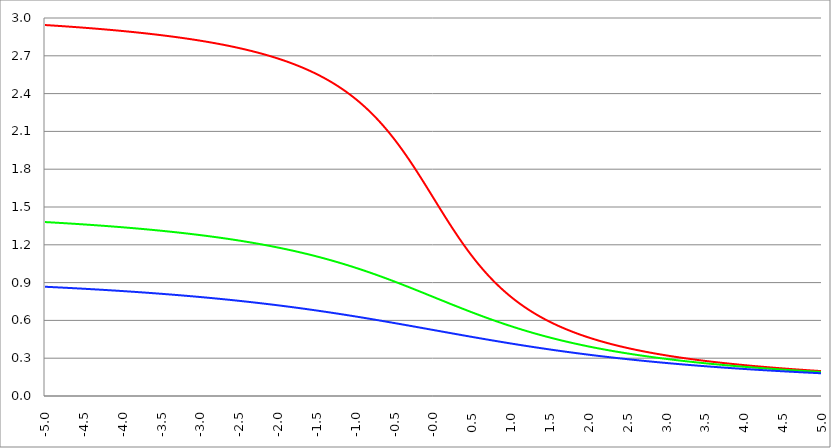
| Category | Series 1 | Series 0 | Series 2 |
|---|---|---|---|
| -5.0 | 2.944 | 1.381 | 0.867 |
| -4.995 | 2.944 | 1.38 | 0.867 |
| -4.99 | 2.944 | 1.38 | 0.867 |
| -4.985 | 2.944 | 1.38 | 0.867 |
| -4.98 | 2.943 | 1.38 | 0.866 |
| -4.975 | 2.943 | 1.38 | 0.866 |
| -4.97 | 2.943 | 1.38 | 0.866 |
| -4.965000000000001 | 2.943 | 1.379 | 0.866 |
| -4.960000000000001 | 2.943 | 1.379 | 0.866 |
| -4.955000000000001 | 2.942 | 1.379 | 0.866 |
| -4.950000000000001 | 2.942 | 1.379 | 0.866 |
| -4.945000000000001 | 2.942 | 1.379 | 0.865 |
| -4.940000000000001 | 2.942 | 1.378 | 0.865 |
| -4.935000000000001 | 2.942 | 1.378 | 0.865 |
| -4.930000000000001 | 2.941 | 1.378 | 0.865 |
| -4.925000000000002 | 2.941 | 1.378 | 0.865 |
| -4.920000000000002 | 2.941 | 1.378 | 0.865 |
| -4.915000000000002 | 2.941 | 1.378 | 0.865 |
| -4.910000000000002 | 2.941 | 1.377 | 0.864 |
| -4.905000000000002 | 2.94 | 1.377 | 0.864 |
| -4.900000000000002 | 2.94 | 1.377 | 0.864 |
| -4.895000000000002 | 2.94 | 1.377 | 0.864 |
| -4.890000000000002 | 2.94 | 1.377 | 0.864 |
| -4.885000000000002 | 2.94 | 1.376 | 0.864 |
| -4.880000000000002 | 2.939 | 1.376 | 0.863 |
| -4.875000000000003 | 2.939 | 1.376 | 0.863 |
| -4.870000000000003 | 2.939 | 1.376 | 0.863 |
| -4.865000000000003 | 2.939 | 1.376 | 0.863 |
| -4.860000000000003 | 2.939 | 1.376 | 0.863 |
| -4.855000000000003 | 2.938 | 1.375 | 0.863 |
| -4.850000000000003 | 2.938 | 1.375 | 0.863 |
| -4.845000000000003 | 2.938 | 1.375 | 0.862 |
| -4.840000000000003 | 2.938 | 1.375 | 0.862 |
| -4.835000000000003 | 2.938 | 1.375 | 0.862 |
| -4.830000000000004 | 2.937 | 1.375 | 0.862 |
| -4.825000000000004 | 2.937 | 1.374 | 0.862 |
| -4.820000000000004 | 2.937 | 1.374 | 0.862 |
| -4.815000000000004 | 2.937 | 1.374 | 0.861 |
| -4.810000000000004 | 2.937 | 1.374 | 0.861 |
| -4.805000000000004 | 2.936 | 1.374 | 0.861 |
| -4.800000000000004 | 2.936 | 1.373 | 0.861 |
| -4.795000000000004 | 2.936 | 1.373 | 0.861 |
| -4.790000000000004 | 2.936 | 1.373 | 0.861 |
| -4.785000000000004 | 2.936 | 1.373 | 0.861 |
| -4.780000000000004 | 2.935 | 1.373 | 0.86 |
| -4.775000000000004 | 2.935 | 1.372 | 0.86 |
| -4.770000000000004 | 2.935 | 1.372 | 0.86 |
| -4.765000000000005 | 2.935 | 1.372 | 0.86 |
| -4.760000000000005 | 2.935 | 1.372 | 0.86 |
| -4.755000000000005 | 2.934 | 1.372 | 0.86 |
| -4.750000000000005 | 2.934 | 1.372 | 0.859 |
| -4.745000000000005 | 2.934 | 1.371 | 0.859 |
| -4.740000000000005 | 2.934 | 1.371 | 0.859 |
| -4.735000000000005 | 2.933 | 1.371 | 0.859 |
| -4.730000000000005 | 2.933 | 1.371 | 0.859 |
| -4.725000000000006 | 2.933 | 1.371 | 0.859 |
| -4.720000000000006 | 2.933 | 1.37 | 0.858 |
| -4.715000000000006 | 2.933 | 1.37 | 0.858 |
| -4.710000000000006 | 2.932 | 1.37 | 0.858 |
| -4.705000000000006 | 2.932 | 1.37 | 0.858 |
| -4.700000000000006 | 2.932 | 1.37 | 0.858 |
| -4.695000000000006 | 2.932 | 1.369 | 0.858 |
| -4.690000000000006 | 2.932 | 1.369 | 0.858 |
| -4.685000000000007 | 2.931 | 1.369 | 0.857 |
| -4.680000000000007 | 2.931 | 1.369 | 0.857 |
| -4.675000000000007 | 2.931 | 1.369 | 0.857 |
| -4.670000000000007 | 2.931 | 1.368 | 0.857 |
| -4.665000000000007 | 2.93 | 1.368 | 0.857 |
| -4.660000000000007 | 2.93 | 1.368 | 0.857 |
| -4.655000000000007 | 2.93 | 1.368 | 0.856 |
| -4.650000000000007 | 2.93 | 1.368 | 0.856 |
| -4.645000000000007 | 2.93 | 1.368 | 0.856 |
| -4.640000000000008 | 2.929 | 1.367 | 0.856 |
| -4.635000000000008 | 2.929 | 1.367 | 0.856 |
| -4.630000000000008 | 2.929 | 1.367 | 0.856 |
| -4.625000000000008 | 2.929 | 1.367 | 0.855 |
| -4.620000000000008 | 2.928 | 1.367 | 0.855 |
| -4.615000000000008 | 2.928 | 1.366 | 0.855 |
| -4.610000000000008 | 2.928 | 1.366 | 0.855 |
| -4.605000000000008 | 2.928 | 1.366 | 0.855 |
| -4.600000000000008 | 2.928 | 1.366 | 0.855 |
| -4.595000000000009 | 2.927 | 1.366 | 0.854 |
| -4.590000000000009 | 2.927 | 1.365 | 0.854 |
| -4.585000000000009 | 2.927 | 1.365 | 0.854 |
| -4.580000000000009 | 2.927 | 1.365 | 0.854 |
| -4.57500000000001 | 2.926 | 1.365 | 0.854 |
| -4.57000000000001 | 2.926 | 1.365 | 0.854 |
| -4.565000000000009 | 2.926 | 1.364 | 0.853 |
| -4.560000000000009 | 2.926 | 1.364 | 0.853 |
| -4.555000000000009 | 2.925 | 1.364 | 0.853 |
| -4.55000000000001 | 2.925 | 1.364 | 0.853 |
| -4.54500000000001 | 2.925 | 1.364 | 0.853 |
| -4.54000000000001 | 2.925 | 1.363 | 0.853 |
| -4.53500000000001 | 2.925 | 1.363 | 0.852 |
| -4.53000000000001 | 2.924 | 1.363 | 0.852 |
| -4.52500000000001 | 2.924 | 1.363 | 0.852 |
| -4.52000000000001 | 2.924 | 1.363 | 0.852 |
| -4.51500000000001 | 2.924 | 1.362 | 0.852 |
| -4.51000000000001 | 2.923 | 1.362 | 0.852 |
| -4.505000000000011 | 2.923 | 1.362 | 0.851 |
| -4.500000000000011 | 2.923 | 1.362 | 0.851 |
| -4.495000000000011 | 2.923 | 1.361 | 0.851 |
| -4.490000000000011 | 2.922 | 1.361 | 0.851 |
| -4.485000000000011 | 2.922 | 1.361 | 0.851 |
| -4.480000000000011 | 2.922 | 1.361 | 0.851 |
| -4.475000000000011 | 2.922 | 1.361 | 0.85 |
| -4.470000000000011 | 2.922 | 1.36 | 0.85 |
| -4.465000000000011 | 2.921 | 1.36 | 0.85 |
| -4.460000000000011 | 2.921 | 1.36 | 0.85 |
| -4.455000000000012 | 2.921 | 1.36 | 0.85 |
| -4.450000000000012 | 2.921 | 1.36 | 0.849 |
| -4.445000000000012 | 2.92 | 1.359 | 0.849 |
| -4.440000000000012 | 2.92 | 1.359 | 0.849 |
| -4.435000000000012 | 2.92 | 1.359 | 0.849 |
| -4.430000000000012 | 2.92 | 1.359 | 0.849 |
| -4.425000000000012 | 2.919 | 1.359 | 0.849 |
| -4.420000000000012 | 2.919 | 1.358 | 0.848 |
| -4.415000000000012 | 2.919 | 1.358 | 0.848 |
| -4.410000000000013 | 2.919 | 1.358 | 0.848 |
| -4.405000000000013 | 2.918 | 1.358 | 0.848 |
| -4.400000000000013 | 2.918 | 1.357 | 0.848 |
| -4.395000000000013 | 2.918 | 1.357 | 0.848 |
| -4.390000000000013 | 2.918 | 1.357 | 0.847 |
| -4.385000000000013 | 2.917 | 1.357 | 0.847 |
| -4.380000000000013 | 2.917 | 1.357 | 0.847 |
| -4.375000000000013 | 2.917 | 1.356 | 0.847 |
| -4.370000000000013 | 2.917 | 1.356 | 0.847 |
| -4.365000000000013 | 2.916 | 1.356 | 0.846 |
| -4.360000000000014 | 2.916 | 1.356 | 0.846 |
| -4.355000000000014 | 2.916 | 1.356 | 0.846 |
| -4.350000000000014 | 2.916 | 1.355 | 0.846 |
| -4.345000000000014 | 2.915 | 1.355 | 0.846 |
| -4.340000000000014 | 2.915 | 1.355 | 0.846 |
| -4.335000000000014 | 2.915 | 1.355 | 0.845 |
| -4.330000000000014 | 2.915 | 1.354 | 0.845 |
| -4.325000000000014 | 2.914 | 1.354 | 0.845 |
| -4.320000000000014 | 2.914 | 1.354 | 0.845 |
| -4.315000000000015 | 2.914 | 1.354 | 0.845 |
| -4.310000000000015 | 2.914 | 1.354 | 0.845 |
| -4.305000000000015 | 2.913 | 1.353 | 0.844 |
| -4.300000000000015 | 2.913 | 1.353 | 0.844 |
| -4.295000000000015 | 2.913 | 1.353 | 0.844 |
| -4.290000000000015 | 2.913 | 1.353 | 0.844 |
| -4.285000000000015 | 2.912 | 1.352 | 0.844 |
| -4.280000000000015 | 2.912 | 1.352 | 0.843 |
| -4.275000000000015 | 2.912 | 1.352 | 0.843 |
| -4.270000000000015 | 2.912 | 1.352 | 0.843 |
| -4.265000000000016 | 2.911 | 1.352 | 0.843 |
| -4.260000000000016 | 2.911 | 1.351 | 0.843 |
| -4.255000000000016 | 2.911 | 1.351 | 0.842 |
| -4.250000000000016 | 2.911 | 1.351 | 0.842 |
| -4.245000000000016 | 2.91 | 1.351 | 0.842 |
| -4.240000000000016 | 2.91 | 1.35 | 0.842 |
| -4.235000000000016 | 2.91 | 1.35 | 0.842 |
| -4.230000000000016 | 2.909 | 1.35 | 0.842 |
| -4.225000000000017 | 2.909 | 1.35 | 0.841 |
| -4.220000000000017 | 2.909 | 1.35 | 0.841 |
| -4.215000000000017 | 2.909 | 1.349 | 0.841 |
| -4.210000000000017 | 2.908 | 1.349 | 0.841 |
| -4.205000000000017 | 2.908 | 1.349 | 0.841 |
| -4.200000000000017 | 2.908 | 1.349 | 0.84 |
| -4.195000000000017 | 2.908 | 1.348 | 0.84 |
| -4.190000000000017 | 2.907 | 1.348 | 0.84 |
| -4.185000000000017 | 2.907 | 1.348 | 0.84 |
| -4.180000000000017 | 2.907 | 1.348 | 0.84 |
| -4.175000000000018 | 2.907 | 1.347 | 0.84 |
| -4.170000000000018 | 2.906 | 1.347 | 0.839 |
| -4.165000000000018 | 2.906 | 1.347 | 0.839 |
| -4.160000000000018 | 2.906 | 1.347 | 0.839 |
| -4.155000000000018 | 2.905 | 1.346 | 0.839 |
| -4.150000000000018 | 2.905 | 1.346 | 0.839 |
| -4.145000000000018 | 2.905 | 1.346 | 0.838 |
| -4.140000000000018 | 2.905 | 1.346 | 0.838 |
| -4.135000000000018 | 2.904 | 1.346 | 0.838 |
| -4.130000000000019 | 2.904 | 1.345 | 0.838 |
| -4.125000000000019 | 2.904 | 1.345 | 0.838 |
| -4.120000000000019 | 2.903 | 1.345 | 0.837 |
| -4.115000000000019 | 2.903 | 1.345 | 0.837 |
| -4.110000000000019 | 2.903 | 1.344 | 0.837 |
| -4.105000000000019 | 2.903 | 1.344 | 0.837 |
| -4.100000000000019 | 2.902 | 1.344 | 0.837 |
| -4.095000000000019 | 2.902 | 1.344 | 0.836 |
| -4.090000000000019 | 2.902 | 1.343 | 0.836 |
| -4.085000000000019 | 2.902 | 1.343 | 0.836 |
| -4.08000000000002 | 2.901 | 1.343 | 0.836 |
| -4.07500000000002 | 2.901 | 1.343 | 0.836 |
| -4.07000000000002 | 2.901 | 1.342 | 0.835 |
| -4.06500000000002 | 2.9 | 1.342 | 0.835 |
| -4.06000000000002 | 2.9 | 1.342 | 0.835 |
| -4.05500000000002 | 2.9 | 1.342 | 0.835 |
| -4.05000000000002 | 2.9 | 1.341 | 0.835 |
| -4.04500000000002 | 2.899 | 1.341 | 0.834 |
| -4.04000000000002 | 2.899 | 1.341 | 0.834 |
| -4.03500000000002 | 2.899 | 1.341 | 0.834 |
| -4.03000000000002 | 2.898 | 1.34 | 0.834 |
| -4.025000000000021 | 2.898 | 1.34 | 0.834 |
| -4.020000000000021 | 2.898 | 1.34 | 0.833 |
| -4.015000000000021 | 2.897 | 1.34 | 0.833 |
| -4.010000000000021 | 2.897 | 1.339 | 0.833 |
| -4.005000000000021 | 2.897 | 1.339 | 0.833 |
| -4.000000000000021 | 2.897 | 1.339 | 0.833 |
| -3.995000000000021 | 2.896 | 1.339 | 0.832 |
| -3.990000000000021 | 2.896 | 1.338 | 0.832 |
| -3.985000000000022 | 2.896 | 1.338 | 0.832 |
| -3.980000000000022 | 2.895 | 1.338 | 0.832 |
| -3.975000000000022 | 2.895 | 1.338 | 0.832 |
| -3.970000000000022 | 2.895 | 1.337 | 0.831 |
| -3.965000000000022 | 2.895 | 1.337 | 0.831 |
| -3.960000000000022 | 2.894 | 1.337 | 0.831 |
| -3.955000000000022 | 2.894 | 1.337 | 0.831 |
| -3.950000000000022 | 2.894 | 1.336 | 0.831 |
| -3.945000000000022 | 2.893 | 1.336 | 0.83 |
| -3.940000000000023 | 2.893 | 1.336 | 0.83 |
| -3.935000000000023 | 2.893 | 1.336 | 0.83 |
| -3.930000000000023 | 2.892 | 1.335 | 0.83 |
| -3.925000000000023 | 2.892 | 1.335 | 0.83 |
| -3.920000000000023 | 2.892 | 1.335 | 0.829 |
| -3.915000000000023 | 2.892 | 1.335 | 0.829 |
| -3.910000000000023 | 2.891 | 1.334 | 0.829 |
| -3.905000000000023 | 2.891 | 1.334 | 0.829 |
| -3.900000000000023 | 2.891 | 1.334 | 0.829 |
| -3.895000000000023 | 2.89 | 1.334 | 0.828 |
| -3.890000000000024 | 2.89 | 1.333 | 0.828 |
| -3.885000000000024 | 2.89 | 1.333 | 0.828 |
| -3.880000000000024 | 2.889 | 1.333 | 0.828 |
| -3.875000000000024 | 2.889 | 1.333 | 0.828 |
| -3.870000000000024 | 2.889 | 1.332 | 0.827 |
| -3.865000000000024 | 2.888 | 1.332 | 0.827 |
| -3.860000000000024 | 2.888 | 1.332 | 0.827 |
| -3.855000000000024 | 2.888 | 1.332 | 0.827 |
| -3.850000000000024 | 2.887 | 1.331 | 0.827 |
| -3.845000000000025 | 2.887 | 1.331 | 0.826 |
| -3.840000000000025 | 2.887 | 1.331 | 0.826 |
| -3.835000000000025 | 2.887 | 1.33 | 0.826 |
| -3.830000000000025 | 2.886 | 1.33 | 0.826 |
| -3.825000000000025 | 2.886 | 1.33 | 0.825 |
| -3.820000000000025 | 2.886 | 1.33 | 0.825 |
| -3.815000000000025 | 2.885 | 1.329 | 0.825 |
| -3.810000000000025 | 2.885 | 1.329 | 0.825 |
| -3.805000000000025 | 2.885 | 1.329 | 0.825 |
| -3.800000000000026 | 2.884 | 1.329 | 0.824 |
| -3.795000000000026 | 2.884 | 1.328 | 0.824 |
| -3.790000000000026 | 2.884 | 1.328 | 0.824 |
| -3.785000000000026 | 2.883 | 1.328 | 0.824 |
| -3.780000000000026 | 2.883 | 1.327 | 0.824 |
| -3.775000000000026 | 2.883 | 1.327 | 0.823 |
| -3.770000000000026 | 2.882 | 1.327 | 0.823 |
| -3.765000000000026 | 2.882 | 1.327 | 0.823 |
| -3.760000000000026 | 2.882 | 1.326 | 0.823 |
| -3.755000000000026 | 2.881 | 1.326 | 0.823 |
| -3.750000000000027 | 2.881 | 1.326 | 0.822 |
| -3.745000000000027 | 2.881 | 1.326 | 0.822 |
| -3.740000000000027 | 2.88 | 1.325 | 0.822 |
| -3.735000000000027 | 2.88 | 1.325 | 0.822 |
| -3.730000000000027 | 2.88 | 1.325 | 0.821 |
| -3.725000000000027 | 2.879 | 1.324 | 0.821 |
| -3.720000000000027 | 2.879 | 1.324 | 0.821 |
| -3.715000000000027 | 2.879 | 1.324 | 0.821 |
| -3.710000000000027 | 2.878 | 1.324 | 0.821 |
| -3.705000000000028 | 2.878 | 1.323 | 0.82 |
| -3.700000000000028 | 2.878 | 1.323 | 0.82 |
| -3.695000000000028 | 2.877 | 1.323 | 0.82 |
| -3.690000000000028 | 2.877 | 1.322 | 0.82 |
| -3.685000000000028 | 2.877 | 1.322 | 0.819 |
| -3.680000000000028 | 2.876 | 1.322 | 0.819 |
| -3.675000000000028 | 2.876 | 1.322 | 0.819 |
| -3.670000000000028 | 2.876 | 1.321 | 0.819 |
| -3.665000000000028 | 2.875 | 1.321 | 0.819 |
| -3.660000000000028 | 2.875 | 1.321 | 0.818 |
| -3.655000000000029 | 2.875 | 1.32 | 0.818 |
| -3.650000000000029 | 2.874 | 1.32 | 0.818 |
| -3.645000000000029 | 2.874 | 1.32 | 0.818 |
| -3.640000000000029 | 2.873 | 1.32 | 0.817 |
| -3.635000000000029 | 2.873 | 1.319 | 0.817 |
| -3.630000000000029 | 2.873 | 1.319 | 0.817 |
| -3.625000000000029 | 2.872 | 1.319 | 0.817 |
| -3.620000000000029 | 2.872 | 1.318 | 0.817 |
| -3.615000000000029 | 2.872 | 1.318 | 0.816 |
| -3.61000000000003 | 2.871 | 1.318 | 0.816 |
| -3.60500000000003 | 2.871 | 1.318 | 0.816 |
| -3.60000000000003 | 2.871 | 1.317 | 0.816 |
| -3.59500000000003 | 2.87 | 1.317 | 0.815 |
| -3.59000000000003 | 2.87 | 1.317 | 0.815 |
| -3.58500000000003 | 2.87 | 1.316 | 0.815 |
| -3.58000000000003 | 2.869 | 1.316 | 0.815 |
| -3.57500000000003 | 2.869 | 1.316 | 0.814 |
| -3.57000000000003 | 2.868 | 1.315 | 0.814 |
| -3.565000000000031 | 2.868 | 1.315 | 0.814 |
| -3.560000000000031 | 2.868 | 1.315 | 0.814 |
| -3.555000000000031 | 2.867 | 1.315 | 0.814 |
| -3.550000000000031 | 2.867 | 1.314 | 0.813 |
| -3.545000000000031 | 2.867 | 1.314 | 0.813 |
| -3.540000000000031 | 2.866 | 1.314 | 0.813 |
| -3.535000000000031 | 2.866 | 1.313 | 0.813 |
| -3.530000000000031 | 2.866 | 1.313 | 0.812 |
| -3.525000000000031 | 2.865 | 1.313 | 0.812 |
| -3.520000000000032 | 2.865 | 1.312 | 0.812 |
| -3.515000000000032 | 2.864 | 1.312 | 0.812 |
| -3.510000000000032 | 2.864 | 1.312 | 0.811 |
| -3.505000000000032 | 2.864 | 1.312 | 0.811 |
| -3.500000000000032 | 2.863 | 1.311 | 0.811 |
| -3.495000000000032 | 2.863 | 1.311 | 0.811 |
| -3.490000000000032 | 2.863 | 1.311 | 0.811 |
| -3.485000000000032 | 2.862 | 1.31 | 0.81 |
| -3.480000000000032 | 2.862 | 1.31 | 0.81 |
| -3.475000000000032 | 2.861 | 1.31 | 0.81 |
| -3.470000000000033 | 2.861 | 1.309 | 0.81 |
| -3.465000000000033 | 2.861 | 1.309 | 0.809 |
| -3.460000000000033 | 2.86 | 1.309 | 0.809 |
| -3.455000000000033 | 2.86 | 1.308 | 0.809 |
| -3.450000000000033 | 2.859 | 1.308 | 0.809 |
| -3.445000000000033 | 2.859 | 1.308 | 0.808 |
| -3.440000000000033 | 2.859 | 1.307 | 0.808 |
| -3.435000000000033 | 2.858 | 1.307 | 0.808 |
| -3.430000000000033 | 2.858 | 1.307 | 0.808 |
| -3.425000000000034 | 2.858 | 1.307 | 0.807 |
| -3.420000000000034 | 2.857 | 1.306 | 0.807 |
| -3.415000000000034 | 2.857 | 1.306 | 0.807 |
| -3.410000000000034 | 2.856 | 1.306 | 0.807 |
| -3.405000000000034 | 2.856 | 1.305 | 0.806 |
| -3.400000000000034 | 2.856 | 1.305 | 0.806 |
| -3.395000000000034 | 2.855 | 1.305 | 0.806 |
| -3.390000000000034 | 2.855 | 1.304 | 0.806 |
| -3.385000000000034 | 2.854 | 1.304 | 0.805 |
| -3.380000000000034 | 2.854 | 1.304 | 0.805 |
| -3.375000000000035 | 2.854 | 1.303 | 0.805 |
| -3.370000000000035 | 2.853 | 1.303 | 0.805 |
| -3.365000000000035 | 2.853 | 1.303 | 0.804 |
| -3.360000000000035 | 2.852 | 1.302 | 0.804 |
| -3.355000000000035 | 2.852 | 1.302 | 0.804 |
| -3.350000000000035 | 2.852 | 1.302 | 0.804 |
| -3.345000000000035 | 2.851 | 1.301 | 0.804 |
| -3.340000000000035 | 2.851 | 1.301 | 0.803 |
| -3.335000000000035 | 2.85 | 1.301 | 0.803 |
| -3.330000000000036 | 2.85 | 1.3 | 0.803 |
| -3.325000000000036 | 2.849 | 1.3 | 0.803 |
| -3.320000000000036 | 2.849 | 1.3 | 0.802 |
| -3.315000000000036 | 2.849 | 1.299 | 0.802 |
| -3.310000000000036 | 2.848 | 1.299 | 0.802 |
| -3.305000000000036 | 2.848 | 1.299 | 0.802 |
| -3.300000000000036 | 2.847 | 1.298 | 0.801 |
| -3.295000000000036 | 2.847 | 1.298 | 0.801 |
| -3.290000000000036 | 2.847 | 1.298 | 0.801 |
| -3.285000000000036 | 2.846 | 1.297 | 0.801 |
| -3.280000000000036 | 2.846 | 1.297 | 0.8 |
| -3.275000000000037 | 2.845 | 1.297 | 0.8 |
| -3.270000000000037 | 2.845 | 1.296 | 0.8 |
| -3.265000000000037 | 2.844 | 1.296 | 0.799 |
| -3.260000000000037 | 2.844 | 1.296 | 0.799 |
| -3.255000000000037 | 2.844 | 1.295 | 0.799 |
| -3.250000000000037 | 2.843 | 1.295 | 0.799 |
| -3.245000000000037 | 2.843 | 1.295 | 0.798 |
| -3.240000000000037 | 2.842 | 1.294 | 0.798 |
| -3.235000000000038 | 2.842 | 1.294 | 0.798 |
| -3.230000000000038 | 2.841 | 1.294 | 0.798 |
| -3.225000000000038 | 2.841 | 1.293 | 0.797 |
| -3.220000000000038 | 2.84 | 1.293 | 0.797 |
| -3.215000000000038 | 2.84 | 1.293 | 0.797 |
| -3.210000000000038 | 2.84 | 1.292 | 0.797 |
| -3.205000000000038 | 2.839 | 1.292 | 0.796 |
| -3.200000000000038 | 2.839 | 1.291 | 0.796 |
| -3.195000000000038 | 2.838 | 1.291 | 0.796 |
| -3.190000000000039 | 2.838 | 1.291 | 0.796 |
| -3.185000000000039 | 2.837 | 1.29 | 0.795 |
| -3.180000000000039 | 2.837 | 1.29 | 0.795 |
| -3.175000000000039 | 2.836 | 1.29 | 0.795 |
| -3.170000000000039 | 2.836 | 1.289 | 0.795 |
| -3.16500000000004 | 2.836 | 1.289 | 0.794 |
| -3.16000000000004 | 2.835 | 1.289 | 0.794 |
| -3.155000000000039 | 2.835 | 1.288 | 0.794 |
| -3.150000000000039 | 2.834 | 1.288 | 0.794 |
| -3.14500000000004 | 2.834 | 1.288 | 0.793 |
| -3.14000000000004 | 2.833 | 1.287 | 0.793 |
| -3.13500000000004 | 2.833 | 1.287 | 0.793 |
| -3.13000000000004 | 2.832 | 1.287 | 0.792 |
| -3.12500000000004 | 2.832 | 1.286 | 0.792 |
| -3.12000000000004 | 2.831 | 1.286 | 0.792 |
| -3.11500000000004 | 2.831 | 1.285 | 0.792 |
| -3.11000000000004 | 2.83 | 1.285 | 0.791 |
| -3.10500000000004 | 2.83 | 1.285 | 0.791 |
| -3.10000000000004 | 2.83 | 1.284 | 0.791 |
| -3.095000000000041 | 2.829 | 1.284 | 0.791 |
| -3.090000000000041 | 2.829 | 1.284 | 0.79 |
| -3.085000000000041 | 2.828 | 1.283 | 0.79 |
| -3.080000000000041 | 2.828 | 1.283 | 0.79 |
| -3.075000000000041 | 2.827 | 1.282 | 0.79 |
| -3.070000000000041 | 2.827 | 1.282 | 0.789 |
| -3.065000000000041 | 2.826 | 1.282 | 0.789 |
| -3.060000000000041 | 2.826 | 1.281 | 0.789 |
| -3.055000000000041 | 2.825 | 1.281 | 0.788 |
| -3.050000000000042 | 2.825 | 1.281 | 0.788 |
| -3.045000000000042 | 2.824 | 1.28 | 0.788 |
| -3.040000000000042 | 2.824 | 1.28 | 0.788 |
| -3.035000000000042 | 2.823 | 1.279 | 0.787 |
| -3.030000000000042 | 2.823 | 1.279 | 0.787 |
| -3.025000000000042 | 2.822 | 1.279 | 0.787 |
| -3.020000000000042 | 2.822 | 1.278 | 0.787 |
| -3.015000000000042 | 2.821 | 1.278 | 0.786 |
| -3.010000000000042 | 2.821 | 1.278 | 0.786 |
| -3.005000000000043 | 2.82 | 1.277 | 0.786 |
| -3.000000000000043 | 2.82 | 1.277 | 0.785 |
| -2.995000000000043 | 2.819 | 1.276 | 0.785 |
| -2.990000000000043 | 2.819 | 1.276 | 0.785 |
| -2.985000000000043 | 2.818 | 1.276 | 0.785 |
| -2.980000000000043 | 2.818 | 1.275 | 0.784 |
| -2.975000000000043 | 2.817 | 1.275 | 0.784 |
| -2.970000000000043 | 2.817 | 1.274 | 0.784 |
| -2.965000000000043 | 2.816 | 1.274 | 0.783 |
| -2.960000000000043 | 2.816 | 1.274 | 0.783 |
| -2.955000000000044 | 2.815 | 1.273 | 0.783 |
| -2.950000000000044 | 2.815 | 1.273 | 0.783 |
| -2.945000000000044 | 2.814 | 1.273 | 0.782 |
| -2.940000000000044 | 2.814 | 1.272 | 0.782 |
| -2.935000000000044 | 2.813 | 1.272 | 0.782 |
| -2.930000000000044 | 2.813 | 1.271 | 0.781 |
| -2.925000000000044 | 2.812 | 1.271 | 0.781 |
| -2.920000000000044 | 2.812 | 1.271 | 0.781 |
| -2.915000000000044 | 2.811 | 1.27 | 0.781 |
| -2.910000000000045 | 2.811 | 1.27 | 0.78 |
| -2.905000000000045 | 2.81 | 1.269 | 0.78 |
| -2.900000000000045 | 2.81 | 1.269 | 0.78 |
| -2.895000000000045 | 2.809 | 1.269 | 0.779 |
| -2.890000000000045 | 2.808 | 1.268 | 0.779 |
| -2.885000000000045 | 2.808 | 1.268 | 0.779 |
| -2.880000000000045 | 2.807 | 1.267 | 0.779 |
| -2.875000000000045 | 2.807 | 1.267 | 0.778 |
| -2.870000000000045 | 2.806 | 1.266 | 0.778 |
| -2.865000000000045 | 2.806 | 1.266 | 0.778 |
| -2.860000000000046 | 2.805 | 1.266 | 0.777 |
| -2.855000000000046 | 2.805 | 1.265 | 0.777 |
| -2.850000000000046 | 2.804 | 1.265 | 0.777 |
| -2.845000000000046 | 2.804 | 1.264 | 0.777 |
| -2.840000000000046 | 2.803 | 1.264 | 0.776 |
| -2.835000000000046 | 2.802 | 1.264 | 0.776 |
| -2.830000000000046 | 2.802 | 1.263 | 0.776 |
| -2.825000000000046 | 2.801 | 1.263 | 0.775 |
| -2.820000000000046 | 2.801 | 1.262 | 0.775 |
| -2.815000000000047 | 2.8 | 1.262 | 0.775 |
| -2.810000000000047 | 2.8 | 1.262 | 0.775 |
| -2.805000000000047 | 2.799 | 1.261 | 0.774 |
| -2.800000000000047 | 2.799 | 1.261 | 0.774 |
| -2.795000000000047 | 2.798 | 1.26 | 0.774 |
| -2.790000000000047 | 2.797 | 1.26 | 0.773 |
| -2.785000000000047 | 2.797 | 1.259 | 0.773 |
| -2.780000000000047 | 2.796 | 1.259 | 0.773 |
| -2.775000000000047 | 2.796 | 1.259 | 0.772 |
| -2.770000000000047 | 2.795 | 1.258 | 0.772 |
| -2.765000000000048 | 2.795 | 1.258 | 0.772 |
| -2.760000000000048 | 2.794 | 1.257 | 0.772 |
| -2.755000000000048 | 2.793 | 1.257 | 0.771 |
| -2.750000000000048 | 2.793 | 1.256 | 0.771 |
| -2.745000000000048 | 2.792 | 1.256 | 0.771 |
| -2.740000000000048 | 2.792 | 1.256 | 0.77 |
| -2.735000000000048 | 2.791 | 1.255 | 0.77 |
| -2.730000000000048 | 2.79 | 1.255 | 0.77 |
| -2.725000000000048 | 2.79 | 1.254 | 0.769 |
| -2.720000000000049 | 2.789 | 1.254 | 0.769 |
| -2.715000000000049 | 2.789 | 1.253 | 0.769 |
| -2.710000000000049 | 2.788 | 1.253 | 0.768 |
| -2.705000000000049 | 2.787 | 1.252 | 0.768 |
| -2.700000000000049 | 2.787 | 1.252 | 0.768 |
| -2.695000000000049 | 2.786 | 1.252 | 0.768 |
| -2.690000000000049 | 2.786 | 1.251 | 0.767 |
| -2.685000000000049 | 2.785 | 1.251 | 0.767 |
| -2.680000000000049 | 2.784 | 1.25 | 0.767 |
| -2.675000000000049 | 2.784 | 1.25 | 0.766 |
| -2.67000000000005 | 2.783 | 1.249 | 0.766 |
| -2.66500000000005 | 2.783 | 1.249 | 0.766 |
| -2.66000000000005 | 2.782 | 1.248 | 0.765 |
| -2.65500000000005 | 2.781 | 1.248 | 0.765 |
| -2.65000000000005 | 2.781 | 1.248 | 0.765 |
| -2.64500000000005 | 2.78 | 1.247 | 0.764 |
| -2.64000000000005 | 2.78 | 1.247 | 0.764 |
| -2.63500000000005 | 2.779 | 1.246 | 0.764 |
| -2.63000000000005 | 2.778 | 1.246 | 0.764 |
| -2.625000000000051 | 2.778 | 1.245 | 0.763 |
| -2.620000000000051 | 2.777 | 1.245 | 0.763 |
| -2.615000000000051 | 2.776 | 1.244 | 0.763 |
| -2.610000000000051 | 2.776 | 1.244 | 0.762 |
| -2.605000000000051 | 2.775 | 1.243 | 0.762 |
| -2.600000000000051 | 2.774 | 1.243 | 0.762 |
| -2.595000000000051 | 2.774 | 1.242 | 0.761 |
| -2.590000000000051 | 2.773 | 1.242 | 0.761 |
| -2.585000000000051 | 2.772 | 1.242 | 0.761 |
| -2.580000000000052 | 2.772 | 1.241 | 0.76 |
| -2.575000000000052 | 2.771 | 1.241 | 0.76 |
| -2.570000000000052 | 2.771 | 1.24 | 0.76 |
| -2.565000000000052 | 2.77 | 1.24 | 0.759 |
| -2.560000000000052 | 2.769 | 1.239 | 0.759 |
| -2.555000000000052 | 2.769 | 1.239 | 0.759 |
| -2.550000000000052 | 2.768 | 1.238 | 0.758 |
| -2.545000000000052 | 2.767 | 1.238 | 0.758 |
| -2.540000000000052 | 2.767 | 1.237 | 0.758 |
| -2.535000000000053 | 2.766 | 1.237 | 0.757 |
| -2.530000000000053 | 2.765 | 1.236 | 0.757 |
| -2.525000000000053 | 2.765 | 1.236 | 0.757 |
| -2.520000000000053 | 2.764 | 1.235 | 0.756 |
| -2.515000000000053 | 2.763 | 1.235 | 0.756 |
| -2.510000000000053 | 2.762 | 1.234 | 0.756 |
| -2.505000000000053 | 2.762 | 1.234 | 0.756 |
| -2.500000000000053 | 2.761 | 1.233 | 0.755 |
| -2.495000000000053 | 2.76 | 1.233 | 0.755 |
| -2.490000000000053 | 2.76 | 1.232 | 0.755 |
| -2.485000000000054 | 2.759 | 1.232 | 0.754 |
| -2.480000000000054 | 2.758 | 1.231 | 0.754 |
| -2.475000000000054 | 2.758 | 1.231 | 0.754 |
| -2.470000000000054 | 2.757 | 1.23 | 0.753 |
| -2.465000000000054 | 2.756 | 1.23 | 0.753 |
| -2.460000000000054 | 2.755 | 1.229 | 0.753 |
| -2.455000000000054 | 2.755 | 1.229 | 0.752 |
| -2.450000000000054 | 2.754 | 1.228 | 0.752 |
| -2.445000000000054 | 2.753 | 1.228 | 0.752 |
| -2.440000000000055 | 2.753 | 1.227 | 0.751 |
| -2.435000000000055 | 2.752 | 1.227 | 0.751 |
| -2.430000000000055 | 2.751 | 1.226 | 0.751 |
| -2.425000000000055 | 2.75 | 1.226 | 0.75 |
| -2.420000000000055 | 2.75 | 1.225 | 0.75 |
| -2.415000000000055 | 2.749 | 1.225 | 0.75 |
| -2.410000000000055 | 2.748 | 1.224 | 0.749 |
| -2.405000000000055 | 2.748 | 1.224 | 0.749 |
| -2.400000000000055 | 2.747 | 1.223 | 0.749 |
| -2.395000000000055 | 2.746 | 1.223 | 0.748 |
| -2.390000000000056 | 2.745 | 1.222 | 0.748 |
| -2.385000000000056 | 2.745 | 1.222 | 0.747 |
| -2.380000000000056 | 2.744 | 1.221 | 0.747 |
| -2.375000000000056 | 2.743 | 1.221 | 0.747 |
| -2.370000000000056 | 2.742 | 1.22 | 0.746 |
| -2.365000000000056 | 2.742 | 1.22 | 0.746 |
| -2.360000000000056 | 2.741 | 1.219 | 0.746 |
| -2.355000000000056 | 2.74 | 1.219 | 0.745 |
| -2.350000000000056 | 2.739 | 1.218 | 0.745 |
| -2.345000000000057 | 2.739 | 1.218 | 0.745 |
| -2.340000000000057 | 2.738 | 1.217 | 0.744 |
| -2.335000000000057 | 2.737 | 1.217 | 0.744 |
| -2.330000000000057 | 2.736 | 1.216 | 0.744 |
| -2.325000000000057 | 2.735 | 1.216 | 0.743 |
| -2.320000000000057 | 2.735 | 1.215 | 0.743 |
| -2.315000000000057 | 2.734 | 1.215 | 0.743 |
| -2.310000000000057 | 2.733 | 1.214 | 0.742 |
| -2.305000000000057 | 2.732 | 1.213 | 0.742 |
| -2.300000000000058 | 2.731 | 1.213 | 0.742 |
| -2.295000000000058 | 2.731 | 1.212 | 0.741 |
| -2.290000000000058 | 2.73 | 1.212 | 0.741 |
| -2.285000000000058 | 2.729 | 1.211 | 0.741 |
| -2.280000000000058 | 2.728 | 1.211 | 0.74 |
| -2.275000000000058 | 2.727 | 1.21 | 0.74 |
| -2.270000000000058 | 2.727 | 1.21 | 0.74 |
| -2.265000000000058 | 2.726 | 1.209 | 0.739 |
| -2.260000000000058 | 2.725 | 1.209 | 0.739 |
| -2.255000000000058 | 2.724 | 1.208 | 0.738 |
| -2.250000000000059 | 2.723 | 1.207 | 0.738 |
| -2.245000000000059 | 2.723 | 1.207 | 0.738 |
| -2.240000000000059 | 2.722 | 1.206 | 0.737 |
| -2.235000000000059 | 2.721 | 1.206 | 0.737 |
| -2.23000000000006 | 2.72 | 1.205 | 0.737 |
| -2.22500000000006 | 2.719 | 1.205 | 0.736 |
| -2.22000000000006 | 2.718 | 1.204 | 0.736 |
| -2.215000000000059 | 2.718 | 1.204 | 0.736 |
| -2.210000000000059 | 2.717 | 1.203 | 0.735 |
| -2.20500000000006 | 2.716 | 1.202 | 0.735 |
| -2.20000000000006 | 2.715 | 1.202 | 0.735 |
| -2.19500000000006 | 2.714 | 1.201 | 0.734 |
| -2.19000000000006 | 2.713 | 1.201 | 0.734 |
| -2.18500000000006 | 2.712 | 1.2 | 0.733 |
| -2.18000000000006 | 2.712 | 1.2 | 0.733 |
| -2.17500000000006 | 2.711 | 1.199 | 0.733 |
| -2.17000000000006 | 2.71 | 1.198 | 0.732 |
| -2.16500000000006 | 2.709 | 1.198 | 0.732 |
| -2.160000000000061 | 2.708 | 1.197 | 0.732 |
| -2.155000000000061 | 2.707 | 1.197 | 0.731 |
| -2.150000000000061 | 2.706 | 1.196 | 0.731 |
| -2.145000000000061 | 2.705 | 1.196 | 0.731 |
| -2.140000000000061 | 2.704 | 1.195 | 0.73 |
| -2.135000000000061 | 2.704 | 1.194 | 0.73 |
| -2.130000000000061 | 2.703 | 1.194 | 0.729 |
| -2.125000000000061 | 2.702 | 1.193 | 0.729 |
| -2.120000000000061 | 2.701 | 1.193 | 0.729 |
| -2.115000000000061 | 2.7 | 1.192 | 0.728 |
| -2.110000000000062 | 2.699 | 1.191 | 0.728 |
| -2.105000000000062 | 2.698 | 1.191 | 0.728 |
| -2.100000000000062 | 2.697 | 1.19 | 0.727 |
| -2.095000000000062 | 2.696 | 1.19 | 0.727 |
| -2.090000000000062 | 2.695 | 1.189 | 0.726 |
| -2.085000000000062 | 2.694 | 1.188 | 0.726 |
| -2.080000000000062 | 2.693 | 1.188 | 0.726 |
| -2.075000000000062 | 2.693 | 1.187 | 0.725 |
| -2.070000000000062 | 2.692 | 1.187 | 0.725 |
| -2.065000000000063 | 2.691 | 1.186 | 0.725 |
| -2.060000000000063 | 2.69 | 1.185 | 0.724 |
| -2.055000000000063 | 2.689 | 1.185 | 0.724 |
| -2.050000000000063 | 2.688 | 1.184 | 0.723 |
| -2.045000000000063 | 2.687 | 1.184 | 0.723 |
| -2.040000000000063 | 2.686 | 1.183 | 0.723 |
| -2.035000000000063 | 2.685 | 1.182 | 0.722 |
| -2.030000000000063 | 2.684 | 1.182 | 0.722 |
| -2.025000000000063 | 2.683 | 1.181 | 0.722 |
| -2.020000000000064 | 2.682 | 1.181 | 0.721 |
| -2.015000000000064 | 2.681 | 1.18 | 0.721 |
| -2.010000000000064 | 2.68 | 1.179 | 0.72 |
| -2.005000000000064 | 2.679 | 1.179 | 0.72 |
| -2.000000000000064 | 2.678 | 1.178 | 0.72 |
| -1.995000000000064 | 2.677 | 1.177 | 0.719 |
| -1.990000000000064 | 2.676 | 1.177 | 0.719 |
| -1.985000000000064 | 2.675 | 1.176 | 0.718 |
| -1.980000000000064 | 2.674 | 1.176 | 0.718 |
| -1.975000000000064 | 2.673 | 1.175 | 0.718 |
| -1.970000000000065 | 2.672 | 1.174 | 0.717 |
| -1.965000000000065 | 2.671 | 1.174 | 0.717 |
| -1.960000000000065 | 2.67 | 1.173 | 0.717 |
| -1.955000000000065 | 2.669 | 1.172 | 0.716 |
| -1.950000000000065 | 2.668 | 1.172 | 0.716 |
| -1.945000000000065 | 2.667 | 1.171 | 0.715 |
| -1.940000000000065 | 2.666 | 1.17 | 0.715 |
| -1.935000000000065 | 2.665 | 1.17 | 0.715 |
| -1.930000000000065 | 2.664 | 1.169 | 0.714 |
| -1.925000000000066 | 2.662 | 1.169 | 0.714 |
| -1.920000000000066 | 2.661 | 1.168 | 0.713 |
| -1.915000000000066 | 2.66 | 1.167 | 0.713 |
| -1.910000000000066 | 2.659 | 1.167 | 0.713 |
| -1.905000000000066 | 2.658 | 1.166 | 0.712 |
| -1.900000000000066 | 2.657 | 1.165 | 0.712 |
| -1.895000000000066 | 2.656 | 1.165 | 0.711 |
| -1.890000000000066 | 2.655 | 1.164 | 0.711 |
| -1.885000000000066 | 2.654 | 1.163 | 0.711 |
| -1.880000000000066 | 2.653 | 1.163 | 0.71 |
| -1.875000000000067 | 2.652 | 1.162 | 0.71 |
| -1.870000000000067 | 2.651 | 1.161 | 0.709 |
| -1.865000000000067 | 2.649 | 1.161 | 0.709 |
| -1.860000000000067 | 2.648 | 1.16 | 0.709 |
| -1.855000000000067 | 2.647 | 1.159 | 0.708 |
| -1.850000000000067 | 2.646 | 1.159 | 0.708 |
| -1.845000000000067 | 2.645 | 1.158 | 0.707 |
| -1.840000000000067 | 2.644 | 1.157 | 0.707 |
| -1.835000000000067 | 2.643 | 1.157 | 0.707 |
| -1.830000000000068 | 2.641 | 1.156 | 0.706 |
| -1.825000000000068 | 2.64 | 1.155 | 0.706 |
| -1.820000000000068 | 2.639 | 1.155 | 0.705 |
| -1.815000000000068 | 2.638 | 1.154 | 0.705 |
| -1.810000000000068 | 2.637 | 1.153 | 0.705 |
| -1.805000000000068 | 2.636 | 1.152 | 0.704 |
| -1.800000000000068 | 2.634 | 1.152 | 0.704 |
| -1.795000000000068 | 2.633 | 1.151 | 0.703 |
| -1.790000000000068 | 2.632 | 1.15 | 0.703 |
| -1.785000000000068 | 2.631 | 1.15 | 0.703 |
| -1.780000000000069 | 2.63 | 1.149 | 0.702 |
| -1.775000000000069 | 2.629 | 1.148 | 0.702 |
| -1.770000000000069 | 2.627 | 1.148 | 0.701 |
| -1.765000000000069 | 2.626 | 1.147 | 0.701 |
| -1.760000000000069 | 2.625 | 1.146 | 0.7 |
| -1.75500000000007 | 2.624 | 1.146 | 0.7 |
| -1.75000000000007 | 2.622 | 1.145 | 0.7 |
| -1.745000000000069 | 2.621 | 1.144 | 0.699 |
| -1.740000000000069 | 2.62 | 1.143 | 0.699 |
| -1.73500000000007 | 2.619 | 1.143 | 0.698 |
| -1.73000000000007 | 2.617 | 1.142 | 0.698 |
| -1.72500000000007 | 2.616 | 1.141 | 0.698 |
| -1.72000000000007 | 2.615 | 1.141 | 0.697 |
| -1.71500000000007 | 2.614 | 1.14 | 0.697 |
| -1.71000000000007 | 2.612 | 1.139 | 0.696 |
| -1.70500000000007 | 2.611 | 1.138 | 0.696 |
| -1.70000000000007 | 2.61 | 1.138 | 0.695 |
| -1.69500000000007 | 2.609 | 1.137 | 0.695 |
| -1.69000000000007 | 2.607 | 1.136 | 0.695 |
| -1.685000000000071 | 2.606 | 1.135 | 0.694 |
| -1.680000000000071 | 2.605 | 1.135 | 0.694 |
| -1.675000000000071 | 2.603 | 1.134 | 0.693 |
| -1.670000000000071 | 2.602 | 1.133 | 0.693 |
| -1.665000000000071 | 2.601 | 1.133 | 0.692 |
| -1.660000000000071 | 2.599 | 1.132 | 0.692 |
| -1.655000000000071 | 2.598 | 1.131 | 0.692 |
| -1.650000000000071 | 2.597 | 1.13 | 0.691 |
| -1.645000000000071 | 2.595 | 1.13 | 0.691 |
| -1.640000000000072 | 2.594 | 1.129 | 0.69 |
| -1.635000000000072 | 2.593 | 1.128 | 0.69 |
| -1.630000000000072 | 2.591 | 1.127 | 0.69 |
| -1.625000000000072 | 2.59 | 1.127 | 0.689 |
| -1.620000000000072 | 2.589 | 1.126 | 0.689 |
| -1.615000000000072 | 2.587 | 1.125 | 0.688 |
| -1.610000000000072 | 2.586 | 1.124 | 0.688 |
| -1.605000000000072 | 2.584 | 1.124 | 0.687 |
| -1.600000000000072 | 2.583 | 1.123 | 0.687 |
| -1.595000000000073 | 2.582 | 1.122 | 0.686 |
| -1.590000000000073 | 2.58 | 1.121 | 0.686 |
| -1.585000000000073 | 2.579 | 1.12 | 0.686 |
| -1.580000000000073 | 2.577 | 1.12 | 0.685 |
| -1.575000000000073 | 2.576 | 1.119 | 0.685 |
| -1.570000000000073 | 2.574 | 1.118 | 0.684 |
| -1.565000000000073 | 2.573 | 1.117 | 0.684 |
| -1.560000000000073 | 2.572 | 1.117 | 0.683 |
| -1.555000000000073 | 2.57 | 1.116 | 0.683 |
| -1.550000000000074 | 2.569 | 1.115 | 0.683 |
| -1.545000000000074 | 2.567 | 1.114 | 0.682 |
| -1.540000000000074 | 2.566 | 1.113 | 0.682 |
| -1.535000000000074 | 2.564 | 1.113 | 0.681 |
| -1.530000000000074 | 2.563 | 1.112 | 0.681 |
| -1.525000000000074 | 2.561 | 1.111 | 0.68 |
| -1.520000000000074 | 2.56 | 1.11 | 0.68 |
| -1.515000000000074 | 2.558 | 1.11 | 0.679 |
| -1.510000000000074 | 2.557 | 1.109 | 0.679 |
| -1.505000000000074 | 2.555 | 1.108 | 0.679 |
| -1.500000000000075 | 2.554 | 1.107 | 0.678 |
| -1.495000000000075 | 2.552 | 1.106 | 0.678 |
| -1.490000000000075 | 2.55 | 1.106 | 0.677 |
| -1.485000000000075 | 2.549 | 1.105 | 0.677 |
| -1.480000000000075 | 2.547 | 1.104 | 0.676 |
| -1.475000000000075 | 2.546 | 1.103 | 0.676 |
| -1.470000000000075 | 2.544 | 1.102 | 0.675 |
| -1.465000000000075 | 2.543 | 1.102 | 0.675 |
| -1.460000000000075 | 2.541 | 1.101 | 0.675 |
| -1.455000000000076 | 2.539 | 1.1 | 0.674 |
| -1.450000000000076 | 2.538 | 1.099 | 0.674 |
| -1.445000000000076 | 2.536 | 1.098 | 0.673 |
| -1.440000000000076 | 2.535 | 1.097 | 0.673 |
| -1.435000000000076 | 2.533 | 1.097 | 0.672 |
| -1.430000000000076 | 2.531 | 1.096 | 0.672 |
| -1.425000000000076 | 2.53 | 1.095 | 0.671 |
| -1.420000000000076 | 2.528 | 1.094 | 0.671 |
| -1.415000000000076 | 2.526 | 1.093 | 0.671 |
| -1.410000000000077 | 2.525 | 1.092 | 0.67 |
| -1.405000000000077 | 2.523 | 1.092 | 0.67 |
| -1.400000000000077 | 2.521 | 1.091 | 0.669 |
| -1.395000000000077 | 2.52 | 1.09 | 0.669 |
| -1.390000000000077 | 2.518 | 1.089 | 0.668 |
| -1.385000000000077 | 2.516 | 1.088 | 0.668 |
| -1.380000000000077 | 2.515 | 1.087 | 0.667 |
| -1.375000000000077 | 2.513 | 1.087 | 0.667 |
| -1.370000000000077 | 2.511 | 1.086 | 0.666 |
| -1.365000000000077 | 2.509 | 1.085 | 0.666 |
| -1.360000000000078 | 2.508 | 1.084 | 0.665 |
| -1.355000000000078 | 2.506 | 1.083 | 0.665 |
| -1.350000000000078 | 2.504 | 1.082 | 0.665 |
| -1.345000000000078 | 2.502 | 1.081 | 0.664 |
| -1.340000000000078 | 2.5 | 1.081 | 0.664 |
| -1.335000000000078 | 2.499 | 1.08 | 0.663 |
| -1.330000000000078 | 2.497 | 1.079 | 0.663 |
| -1.325000000000078 | 2.495 | 1.078 | 0.662 |
| -1.320000000000078 | 2.493 | 1.077 | 0.662 |
| -1.315000000000079 | 2.491 | 1.076 | 0.661 |
| -1.310000000000079 | 2.49 | 1.075 | 0.661 |
| -1.305000000000079 | 2.488 | 1.074 | 0.66 |
| -1.300000000000079 | 2.486 | 1.074 | 0.66 |
| -1.295000000000079 | 2.484 | 1.073 | 0.659 |
| -1.29000000000008 | 2.482 | 1.072 | 0.659 |
| -1.285000000000079 | 2.48 | 1.071 | 0.658 |
| -1.280000000000079 | 2.478 | 1.07 | 0.658 |
| -1.275000000000079 | 2.476 | 1.069 | 0.658 |
| -1.270000000000079 | 2.475 | 1.068 | 0.657 |
| -1.26500000000008 | 2.473 | 1.067 | 0.657 |
| -1.26000000000008 | 2.471 | 1.066 | 0.656 |
| -1.25500000000008 | 2.469 | 1.066 | 0.656 |
| -1.25000000000008 | 2.467 | 1.065 | 0.655 |
| -1.24500000000008 | 2.465 | 1.064 | 0.655 |
| -1.24000000000008 | 2.463 | 1.063 | 0.654 |
| -1.23500000000008 | 2.461 | 1.062 | 0.654 |
| -1.23000000000008 | 2.459 | 1.061 | 0.653 |
| -1.22500000000008 | 2.457 | 1.06 | 0.653 |
| -1.220000000000081 | 2.455 | 1.059 | 0.652 |
| -1.215000000000081 | 2.453 | 1.058 | 0.652 |
| -1.210000000000081 | 2.451 | 1.057 | 0.651 |
| -1.205000000000081 | 2.449 | 1.057 | 0.651 |
| -1.200000000000081 | 2.447 | 1.056 | 0.65 |
| -1.195000000000081 | 2.445 | 1.055 | 0.65 |
| -1.190000000000081 | 2.443 | 1.054 | 0.649 |
| -1.185000000000081 | 2.441 | 1.053 | 0.649 |
| -1.180000000000081 | 2.439 | 1.052 | 0.649 |
| -1.175000000000082 | 2.436 | 1.051 | 0.648 |
| -1.170000000000082 | 2.434 | 1.05 | 0.648 |
| -1.165000000000082 | 2.432 | 1.049 | 0.647 |
| -1.160000000000082 | 2.43 | 1.048 | 0.647 |
| -1.155000000000082 | 2.428 | 1.047 | 0.646 |
| -1.150000000000082 | 2.426 | 1.046 | 0.646 |
| -1.145000000000082 | 2.424 | 1.045 | 0.645 |
| -1.140000000000082 | 2.422 | 1.044 | 0.645 |
| -1.135000000000082 | 2.419 | 1.043 | 0.644 |
| -1.130000000000082 | 2.417 | 1.043 | 0.644 |
| -1.125000000000083 | 2.415 | 1.042 | 0.643 |
| -1.120000000000083 | 2.413 | 1.041 | 0.643 |
| -1.115000000000083 | 2.411 | 1.04 | 0.642 |
| -1.110000000000083 | 2.408 | 1.039 | 0.642 |
| -1.105000000000083 | 2.406 | 1.038 | 0.641 |
| -1.100000000000083 | 2.404 | 1.037 | 0.641 |
| -1.095000000000083 | 2.402 | 1.036 | 0.64 |
| -1.090000000000083 | 2.399 | 1.035 | 0.64 |
| -1.085000000000083 | 2.397 | 1.034 | 0.639 |
| -1.080000000000084 | 2.395 | 1.033 | 0.639 |
| -1.075000000000084 | 2.392 | 1.032 | 0.638 |
| -1.070000000000084 | 2.39 | 1.031 | 0.638 |
| -1.065000000000084 | 2.388 | 1.03 | 0.637 |
| -1.060000000000084 | 2.385 | 1.029 | 0.637 |
| -1.055000000000084 | 2.383 | 1.028 | 0.636 |
| -1.050000000000084 | 2.381 | 1.027 | 0.636 |
| -1.045000000000084 | 2.378 | 1.026 | 0.635 |
| -1.040000000000084 | 2.376 | 1.025 | 0.635 |
| -1.035000000000085 | 2.373 | 1.024 | 0.634 |
| -1.030000000000085 | 2.371 | 1.023 | 0.634 |
| -1.025000000000085 | 2.369 | 1.022 | 0.633 |
| -1.020000000000085 | 2.366 | 1.021 | 0.633 |
| -1.015000000000085 | 2.364 | 1.02 | 0.632 |
| -1.010000000000085 | 2.361 | 1.019 | 0.632 |
| -1.005000000000085 | 2.359 | 1.018 | 0.631 |
| -1.000000000000085 | 2.356 | 1.017 | 0.631 |
| -0.995000000000085 | 2.354 | 1.016 | 0.63 |
| -0.990000000000085 | 2.351 | 1.015 | 0.63 |
| -0.985000000000085 | 2.349 | 1.014 | 0.629 |
| -0.980000000000085 | 2.346 | 1.013 | 0.629 |
| -0.975000000000085 | 2.344 | 1.012 | 0.628 |
| -0.970000000000085 | 2.341 | 1.011 | 0.628 |
| -0.965000000000085 | 2.338 | 1.01 | 0.627 |
| -0.960000000000085 | 2.336 | 1.009 | 0.627 |
| -0.955000000000085 | 2.333 | 1.008 | 0.626 |
| -0.950000000000085 | 2.331 | 1.007 | 0.626 |
| -0.945000000000085 | 2.328 | 1.006 | 0.625 |
| -0.940000000000085 | 2.325 | 1.005 | 0.625 |
| -0.935000000000085 | 2.323 | 1.004 | 0.624 |
| -0.930000000000085 | 2.32 | 1.003 | 0.624 |
| -0.925000000000085 | 2.317 | 1.002 | 0.623 |
| -0.920000000000085 | 2.315 | 1.001 | 0.623 |
| -0.915000000000085 | 2.312 | 1 | 0.622 |
| -0.910000000000085 | 2.309 | 0.999 | 0.622 |
| -0.905000000000085 | 2.306 | 0.998 | 0.621 |
| -0.900000000000085 | 2.304 | 0.997 | 0.621 |
| -0.895000000000085 | 2.301 | 0.996 | 0.62 |
| -0.890000000000085 | 2.298 | 0.995 | 0.62 |
| -0.885000000000085 | 2.295 | 0.994 | 0.619 |
| -0.880000000000085 | 2.292 | 0.993 | 0.619 |
| -0.875000000000085 | 2.29 | 0.992 | 0.618 |
| -0.870000000000085 | 2.287 | 0.991 | 0.618 |
| -0.865000000000085 | 2.284 | 0.99 | 0.617 |
| -0.860000000000085 | 2.281 | 0.988 | 0.617 |
| -0.855000000000085 | 2.278 | 0.987 | 0.616 |
| -0.850000000000085 | 2.275 | 0.986 | 0.616 |
| -0.845000000000085 | 2.272 | 0.985 | 0.615 |
| -0.840000000000085 | 2.269 | 0.984 | 0.615 |
| -0.835000000000085 | 2.267 | 0.983 | 0.614 |
| -0.830000000000085 | 2.264 | 0.982 | 0.614 |
| -0.825000000000085 | 2.261 | 0.981 | 0.613 |
| -0.820000000000085 | 2.258 | 0.98 | 0.613 |
| -0.815000000000085 | 2.255 | 0.979 | 0.612 |
| -0.810000000000085 | 2.252 | 0.978 | 0.612 |
| -0.805000000000085 | 2.249 | 0.977 | 0.611 |
| -0.800000000000085 | 2.246 | 0.976 | 0.61 |
| -0.795000000000085 | 2.242 | 0.975 | 0.61 |
| -0.790000000000085 | 2.239 | 0.973 | 0.609 |
| -0.785000000000085 | 2.236 | 0.972 | 0.609 |
| -0.780000000000085 | 2.233 | 0.971 | 0.608 |
| -0.775000000000085 | 2.23 | 0.97 | 0.608 |
| -0.770000000000085 | 2.227 | 0.969 | 0.607 |
| -0.765000000000085 | 2.224 | 0.968 | 0.607 |
| -0.760000000000085 | 2.221 | 0.967 | 0.606 |
| -0.755000000000085 | 2.217 | 0.966 | 0.606 |
| -0.750000000000085 | 2.214 | 0.965 | 0.605 |
| -0.745000000000085 | 2.211 | 0.964 | 0.605 |
| -0.740000000000085 | 2.208 | 0.963 | 0.604 |
| -0.735000000000085 | 2.205 | 0.961 | 0.604 |
| -0.730000000000085 | 2.201 | 0.96 | 0.603 |
| -0.725000000000085 | 2.198 | 0.959 | 0.603 |
| -0.720000000000085 | 2.195 | 0.958 | 0.602 |
| -0.715000000000085 | 2.192 | 0.957 | 0.602 |
| -0.710000000000085 | 2.188 | 0.956 | 0.601 |
| -0.705000000000085 | 2.185 | 0.955 | 0.601 |
| -0.700000000000085 | 2.182 | 0.954 | 0.6 |
| -0.695000000000085 | 2.178 | 0.953 | 0.599 |
| -0.690000000000085 | 2.175 | 0.952 | 0.599 |
| -0.685000000000085 | 2.171 | 0.95 | 0.598 |
| -0.680000000000085 | 2.168 | 0.949 | 0.598 |
| -0.675000000000085 | 2.165 | 0.948 | 0.597 |
| -0.670000000000085 | 2.161 | 0.947 | 0.597 |
| -0.665000000000085 | 2.158 | 0.946 | 0.596 |
| -0.660000000000085 | 2.154 | 0.945 | 0.596 |
| -0.655000000000085 | 2.151 | 0.944 | 0.595 |
| -0.650000000000085 | 2.147 | 0.943 | 0.595 |
| -0.645000000000085 | 2.144 | 0.941 | 0.594 |
| -0.640000000000085 | 2.14 | 0.94 | 0.594 |
| -0.635000000000085 | 2.137 | 0.939 | 0.593 |
| -0.630000000000085 | 2.133 | 0.938 | 0.593 |
| -0.625000000000085 | 2.129 | 0.937 | 0.592 |
| -0.620000000000085 | 2.126 | 0.936 | 0.592 |
| -0.615000000000085 | 2.122 | 0.935 | 0.591 |
| -0.610000000000085 | 2.119 | 0.933 | 0.59 |
| -0.605000000000085 | 2.115 | 0.932 | 0.59 |
| -0.600000000000085 | 2.111 | 0.931 | 0.589 |
| -0.595000000000085 | 2.108 | 0.93 | 0.589 |
| -0.590000000000085 | 2.104 | 0.929 | 0.588 |
| -0.585000000000085 | 2.1 | 0.928 | 0.588 |
| -0.580000000000085 | 2.096 | 0.927 | 0.587 |
| -0.575000000000085 | 2.093 | 0.925 | 0.587 |
| -0.570000000000085 | 2.089 | 0.924 | 0.586 |
| -0.565000000000085 | 2.085 | 0.923 | 0.586 |
| -0.560000000000085 | 2.081 | 0.922 | 0.585 |
| -0.555000000000085 | 2.077 | 0.921 | 0.585 |
| -0.550000000000085 | 2.074 | 0.92 | 0.584 |
| -0.545000000000085 | 2.07 | 0.918 | 0.584 |
| -0.540000000000085 | 2.066 | 0.917 | 0.583 |
| -0.535000000000085 | 2.062 | 0.916 | 0.582 |
| -0.530000000000085 | 2.058 | 0.915 | 0.582 |
| -0.525000000000085 | 2.054 | 0.914 | 0.581 |
| -0.520000000000085 | 2.05 | 0.913 | 0.581 |
| -0.515000000000085 | 2.046 | 0.911 | 0.58 |
| -0.510000000000085 | 2.042 | 0.91 | 0.58 |
| -0.505000000000085 | 2.038 | 0.909 | 0.579 |
| -0.500000000000085 | 2.034 | 0.908 | 0.579 |
| -0.495000000000085 | 2.03 | 0.907 | 0.578 |
| -0.490000000000085 | 2.026 | 0.906 | 0.578 |
| -0.485000000000085 | 2.022 | 0.904 | 0.577 |
| -0.480000000000085 | 2.018 | 0.903 | 0.576 |
| -0.475000000000085 | 2.014 | 0.902 | 0.576 |
| -0.470000000000085 | 2.01 | 0.901 | 0.575 |
| -0.465000000000085 | 2.006 | 0.9 | 0.575 |
| -0.460000000000085 | 2.002 | 0.898 | 0.574 |
| -0.455000000000085 | 1.998 | 0.897 | 0.574 |
| -0.450000000000085 | 1.994 | 0.896 | 0.573 |
| -0.445000000000085 | 1.989 | 0.895 | 0.573 |
| -0.440000000000085 | 1.985 | 0.894 | 0.572 |
| -0.435000000000085 | 1.981 | 0.892 | 0.572 |
| -0.430000000000085 | 1.977 | 0.891 | 0.571 |
| -0.425000000000085 | 1.973 | 0.89 | 0.571 |
| -0.420000000000085 | 1.968 | 0.889 | 0.57 |
| -0.415000000000085 | 1.964 | 0.888 | 0.569 |
| -0.410000000000085 | 1.96 | 0.886 | 0.569 |
| -0.405000000000085 | 1.956 | 0.885 | 0.568 |
| -0.400000000000085 | 1.951 | 0.884 | 0.568 |
| -0.395000000000085 | 1.947 | 0.883 | 0.567 |
| -0.390000000000085 | 1.943 | 0.882 | 0.567 |
| -0.385000000000085 | 1.938 | 0.88 | 0.566 |
| -0.380000000000085 | 1.934 | 0.879 | 0.566 |
| -0.375000000000085 | 1.93 | 0.878 | 0.565 |
| -0.370000000000085 | 1.925 | 0.877 | 0.565 |
| -0.365000000000085 | 1.921 | 0.876 | 0.564 |
| -0.360000000000085 | 1.916 | 0.874 | 0.563 |
| -0.355000000000085 | 1.912 | 0.873 | 0.563 |
| -0.350000000000085 | 1.907 | 0.872 | 0.562 |
| -0.345000000000085 | 1.903 | 0.871 | 0.562 |
| -0.340000000000085 | 1.899 | 0.87 | 0.561 |
| -0.335000000000085 | 1.894 | 0.868 | 0.561 |
| -0.330000000000085 | 1.89 | 0.867 | 0.56 |
| -0.325000000000085 | 1.885 | 0.866 | 0.56 |
| -0.320000000000085 | 1.88 | 0.865 | 0.559 |
| -0.315000000000085 | 1.876 | 0.864 | 0.558 |
| -0.310000000000085 | 1.871 | 0.862 | 0.558 |
| -0.305000000000085 | 1.867 | 0.861 | 0.557 |
| -0.300000000000085 | 1.862 | 0.86 | 0.557 |
| -0.295000000000085 | 1.858 | 0.859 | 0.556 |
| -0.290000000000085 | 1.853 | 0.857 | 0.556 |
| -0.285000000000085 | 1.848 | 0.856 | 0.555 |
| -0.280000000000085 | 1.844 | 0.855 | 0.555 |
| -0.275000000000085 | 1.839 | 0.854 | 0.554 |
| -0.270000000000085 | 1.835 | 0.852 | 0.554 |
| -0.265000000000085 | 1.83 | 0.851 | 0.553 |
| -0.260000000000085 | 1.825 | 0.85 | 0.552 |
| -0.255000000000085 | 1.82 | 0.849 | 0.552 |
| -0.250000000000085 | 1.816 | 0.848 | 0.551 |
| -0.245000000000085 | 1.811 | 0.846 | 0.551 |
| -0.240000000000085 | 1.806 | 0.845 | 0.55 |
| -0.235000000000085 | 1.802 | 0.844 | 0.55 |
| -0.230000000000085 | 1.797 | 0.843 | 0.549 |
| -0.225000000000085 | 1.792 | 0.841 | 0.549 |
| -0.220000000000085 | 1.787 | 0.84 | 0.548 |
| -0.215000000000085 | 1.783 | 0.839 | 0.547 |
| -0.210000000000085 | 1.778 | 0.838 | 0.547 |
| -0.205000000000085 | 1.773 | 0.836 | 0.546 |
| -0.200000000000085 | 1.768 | 0.835 | 0.546 |
| -0.195000000000085 | 1.763 | 0.834 | 0.545 |
| -0.190000000000085 | 1.759 | 0.833 | 0.545 |
| -0.185000000000085 | 1.754 | 0.832 | 0.544 |
| -0.180000000000085 | 1.749 | 0.83 | 0.544 |
| -0.175000000000085 | 1.744 | 0.829 | 0.543 |
| -0.170000000000085 | 1.739 | 0.828 | 0.542 |
| -0.165000000000085 | 1.734 | 0.827 | 0.542 |
| -0.160000000000085 | 1.729 | 0.825 | 0.541 |
| -0.155000000000084 | 1.725 | 0.824 | 0.541 |
| -0.150000000000084 | 1.72 | 0.823 | 0.54 |
| -0.145000000000084 | 1.715 | 0.822 | 0.54 |
| -0.140000000000084 | 1.71 | 0.82 | 0.539 |
| -0.135000000000084 | 1.705 | 0.819 | 0.539 |
| -0.130000000000084 | 1.7 | 0.818 | 0.538 |
| -0.125000000000084 | 1.695 | 0.817 | 0.537 |
| -0.120000000000084 | 1.69 | 0.815 | 0.537 |
| -0.115000000000084 | 1.685 | 0.814 | 0.536 |
| -0.110000000000084 | 1.68 | 0.813 | 0.536 |
| -0.105000000000084 | 1.675 | 0.812 | 0.535 |
| -0.100000000000084 | 1.67 | 0.81 | 0.535 |
| -0.0950000000000844 | 1.666 | 0.809 | 0.534 |
| -0.0900000000000844 | 1.661 | 0.808 | 0.534 |
| -0.0850000000000844 | 1.656 | 0.807 | 0.533 |
| -0.0800000000000844 | 1.651 | 0.805 | 0.532 |
| -0.0750000000000844 | 1.646 | 0.804 | 0.532 |
| -0.0700000000000844 | 1.641 | 0.803 | 0.531 |
| -0.0650000000000844 | 1.636 | 0.802 | 0.531 |
| -0.0600000000000844 | 1.631 | 0.8 | 0.53 |
| -0.0550000000000844 | 1.626 | 0.799 | 0.53 |
| -0.0500000000000844 | 1.621 | 0.798 | 0.529 |
| -0.0450000000000844 | 1.616 | 0.797 | 0.529 |
| -0.0400000000000844 | 1.611 | 0.795 | 0.528 |
| -0.0350000000000844 | 1.606 | 0.794 | 0.527 |
| -0.0300000000000844 | 1.601 | 0.793 | 0.527 |
| -0.0250000000000844 | 1.596 | 0.792 | 0.526 |
| -0.0200000000000844 | 1.591 | 0.79 | 0.526 |
| -0.0150000000000844 | 1.586 | 0.789 | 0.525 |
| -0.0100000000000844 | 1.581 | 0.788 | 0.525 |
| -0.00500000000008444 | 1.576 | 0.787 | 0.524 |
| -8.4444604087075e-14 | 1.571 | 0.785 | 0.524 |
| 0.00499999999991555 | 1.566 | 0.784 | 0.523 |
| 0.00999999999991555 | 1.561 | 0.783 | 0.522 |
| 0.0149999999999156 | 1.556 | 0.782 | 0.522 |
| 0.0199999999999156 | 1.551 | 0.78 | 0.521 |
| 0.0249999999999156 | 1.546 | 0.779 | 0.521 |
| 0.0299999999999156 | 1.541 | 0.778 | 0.52 |
| 0.0349999999999155 | 1.536 | 0.777 | 0.52 |
| 0.0399999999999155 | 1.531 | 0.775 | 0.519 |
| 0.0449999999999155 | 1.526 | 0.774 | 0.519 |
| 0.0499999999999155 | 1.521 | 0.773 | 0.518 |
| 0.0549999999999155 | 1.516 | 0.772 | 0.517 |
| 0.0599999999999155 | 1.511 | 0.77 | 0.517 |
| 0.0649999999999155 | 1.506 | 0.769 | 0.516 |
| 0.0699999999999155 | 1.501 | 0.768 | 0.516 |
| 0.0749999999999155 | 1.496 | 0.767 | 0.515 |
| 0.0799999999999155 | 1.491 | 0.765 | 0.515 |
| 0.0849999999999155 | 1.486 | 0.764 | 0.514 |
| 0.0899999999999155 | 1.481 | 0.763 | 0.514 |
| 0.0949999999999155 | 1.476 | 0.762 | 0.513 |
| 0.0999999999999155 | 1.471 | 0.76 | 0.512 |
| 0.104999999999916 | 1.466 | 0.759 | 0.512 |
| 0.109999999999916 | 1.461 | 0.758 | 0.511 |
| 0.114999999999916 | 1.456 | 0.757 | 0.511 |
| 0.119999999999916 | 1.451 | 0.755 | 0.51 |
| 0.124999999999916 | 1.446 | 0.754 | 0.51 |
| 0.129999999999916 | 1.442 | 0.753 | 0.509 |
| 0.134999999999916 | 1.437 | 0.752 | 0.509 |
| 0.139999999999916 | 1.432 | 0.75 | 0.508 |
| 0.144999999999916 | 1.427 | 0.749 | 0.508 |
| 0.149999999999916 | 1.422 | 0.748 | 0.507 |
| 0.154999999999916 | 1.417 | 0.747 | 0.506 |
| 0.159999999999916 | 1.412 | 0.745 | 0.506 |
| 0.164999999999916 | 1.407 | 0.744 | 0.505 |
| 0.169999999999916 | 1.402 | 0.743 | 0.505 |
| 0.174999999999916 | 1.398 | 0.742 | 0.504 |
| 0.179999999999916 | 1.393 | 0.741 | 0.504 |
| 0.184999999999916 | 1.388 | 0.739 | 0.503 |
| 0.189999999999916 | 1.383 | 0.738 | 0.503 |
| 0.194999999999916 | 1.378 | 0.737 | 0.502 |
| 0.199999999999916 | 1.373 | 0.736 | 0.501 |
| 0.204999999999916 | 1.369 | 0.734 | 0.501 |
| 0.209999999999916 | 1.364 | 0.733 | 0.5 |
| 0.214999999999916 | 1.359 | 0.732 | 0.5 |
| 0.219999999999916 | 1.354 | 0.731 | 0.499 |
| 0.224999999999916 | 1.349 | 0.729 | 0.499 |
| 0.229999999999916 | 1.345 | 0.728 | 0.498 |
| 0.234999999999916 | 1.34 | 0.727 | 0.498 |
| 0.239999999999916 | 1.335 | 0.726 | 0.497 |
| 0.244999999999916 | 1.331 | 0.724 | 0.496 |
| 0.249999999999916 | 1.326 | 0.723 | 0.496 |
| 0.254999999999916 | 1.321 | 0.722 | 0.495 |
| 0.259999999999916 | 1.316 | 0.721 | 0.495 |
| 0.264999999999916 | 1.312 | 0.72 | 0.494 |
| 0.269999999999916 | 1.307 | 0.718 | 0.494 |
| 0.274999999999916 | 1.302 | 0.717 | 0.493 |
| 0.279999999999916 | 1.298 | 0.716 | 0.493 |
| 0.284999999999916 | 1.293 | 0.715 | 0.492 |
| 0.289999999999916 | 1.289 | 0.713 | 0.491 |
| 0.294999999999916 | 1.284 | 0.712 | 0.491 |
| 0.299999999999916 | 1.279 | 0.711 | 0.49 |
| 0.304999999999916 | 1.275 | 0.71 | 0.49 |
| 0.309999999999916 | 1.27 | 0.709 | 0.489 |
| 0.314999999999916 | 1.266 | 0.707 | 0.489 |
| 0.319999999999916 | 1.261 | 0.706 | 0.488 |
| 0.324999999999916 | 1.257 | 0.705 | 0.488 |
| 0.329999999999916 | 1.252 | 0.704 | 0.487 |
| 0.334999999999916 | 1.248 | 0.702 | 0.487 |
| 0.339999999999916 | 1.243 | 0.701 | 0.486 |
| 0.344999999999916 | 1.239 | 0.7 | 0.485 |
| 0.349999999999916 | 1.234 | 0.699 | 0.485 |
| 0.354999999999916 | 1.23 | 0.698 | 0.484 |
| 0.359999999999916 | 1.225 | 0.696 | 0.484 |
| 0.364999999999916 | 1.221 | 0.695 | 0.483 |
| 0.369999999999916 | 1.216 | 0.694 | 0.483 |
| 0.374999999999916 | 1.212 | 0.693 | 0.482 |
| 0.379999999999916 | 1.208 | 0.692 | 0.482 |
| 0.384999999999916 | 1.203 | 0.69 | 0.481 |
| 0.389999999999916 | 1.199 | 0.689 | 0.481 |
| 0.394999999999916 | 1.195 | 0.688 | 0.48 |
| 0.399999999999916 | 1.19 | 0.687 | 0.479 |
| 0.404999999999916 | 1.186 | 0.685 | 0.479 |
| 0.409999999999916 | 1.182 | 0.684 | 0.478 |
| 0.414999999999916 | 1.177 | 0.683 | 0.478 |
| 0.419999999999916 | 1.173 | 0.682 | 0.477 |
| 0.424999999999916 | 1.169 | 0.681 | 0.477 |
| 0.429999999999916 | 1.165 | 0.68 | 0.476 |
| 0.434999999999916 | 1.16 | 0.678 | 0.476 |
| 0.439999999999916 | 1.156 | 0.677 | 0.475 |
| 0.444999999999916 | 1.152 | 0.676 | 0.475 |
| 0.449999999999916 | 1.148 | 0.675 | 0.474 |
| 0.454999999999916 | 1.144 | 0.674 | 0.473 |
| 0.459999999999916 | 1.14 | 0.672 | 0.473 |
| 0.464999999999916 | 1.136 | 0.671 | 0.472 |
| 0.469999999999916 | 1.131 | 0.67 | 0.472 |
| 0.474999999999916 | 1.127 | 0.669 | 0.471 |
| 0.479999999999916 | 1.123 | 0.668 | 0.471 |
| 0.484999999999916 | 1.119 | 0.666 | 0.47 |
| 0.489999999999916 | 1.115 | 0.665 | 0.47 |
| 0.494999999999916 | 1.111 | 0.664 | 0.469 |
| 0.499999999999916 | 1.107 | 0.663 | 0.469 |
| 0.504999999999916 | 1.103 | 0.662 | 0.468 |
| 0.509999999999916 | 1.099 | 0.661 | 0.467 |
| 0.514999999999916 | 1.095 | 0.659 | 0.467 |
| 0.519999999999916 | 1.091 | 0.658 | 0.466 |
| 0.524999999999916 | 1.087 | 0.657 | 0.466 |
| 0.529999999999916 | 1.083 | 0.656 | 0.465 |
| 0.534999999999916 | 1.08 | 0.655 | 0.465 |
| 0.539999999999916 | 1.076 | 0.654 | 0.464 |
| 0.544999999999916 | 1.072 | 0.652 | 0.464 |
| 0.549999999999916 | 1.068 | 0.651 | 0.463 |
| 0.554999999999916 | 1.064 | 0.65 | 0.463 |
| 0.559999999999916 | 1.06 | 0.649 | 0.462 |
| 0.564999999999916 | 1.057 | 0.648 | 0.462 |
| 0.569999999999916 | 1.053 | 0.647 | 0.461 |
| 0.574999999999916 | 1.049 | 0.645 | 0.46 |
| 0.579999999999916 | 1.045 | 0.644 | 0.46 |
| 0.584999999999916 | 1.041 | 0.643 | 0.459 |
| 0.589999999999916 | 1.038 | 0.642 | 0.459 |
| 0.594999999999916 | 1.034 | 0.641 | 0.458 |
| 0.599999999999916 | 1.03 | 0.64 | 0.458 |
| 0.604999999999916 | 1.027 | 0.639 | 0.457 |
| 0.609999999999916 | 1.023 | 0.637 | 0.457 |
| 0.614999999999916 | 1.019 | 0.636 | 0.456 |
| 0.619999999999916 | 1.016 | 0.635 | 0.456 |
| 0.624999999999916 | 1.012 | 0.634 | 0.455 |
| 0.629999999999916 | 1.009 | 0.633 | 0.455 |
| 0.634999999999916 | 1.005 | 0.632 | 0.454 |
| 0.639999999999916 | 1.001 | 0.631 | 0.454 |
| 0.644999999999916 | 0.998 | 0.629 | 0.453 |
| 0.649999999999916 | 0.994 | 0.628 | 0.452 |
| 0.654999999999916 | 0.991 | 0.627 | 0.452 |
| 0.659999999999916 | 0.987 | 0.626 | 0.451 |
| 0.664999999999916 | 0.984 | 0.625 | 0.451 |
| 0.669999999999916 | 0.98 | 0.624 | 0.45 |
| 0.674999999999916 | 0.977 | 0.623 | 0.45 |
| 0.679999999999916 | 0.974 | 0.622 | 0.449 |
| 0.684999999999916 | 0.97 | 0.62 | 0.449 |
| 0.689999999999916 | 0.967 | 0.619 | 0.448 |
| 0.694999999999916 | 0.963 | 0.618 | 0.448 |
| 0.699999999999916 | 0.96 | 0.617 | 0.447 |
| 0.704999999999916 | 0.957 | 0.616 | 0.447 |
| 0.709999999999916 | 0.953 | 0.615 | 0.446 |
| 0.714999999999916 | 0.95 | 0.614 | 0.446 |
| 0.719999999999916 | 0.947 | 0.613 | 0.445 |
| 0.724999999999916 | 0.943 | 0.612 | 0.445 |
| 0.729999999999916 | 0.94 | 0.61 | 0.444 |
| 0.734999999999916 | 0.937 | 0.609 | 0.444 |
| 0.739999999999916 | 0.934 | 0.608 | 0.443 |
| 0.744999999999916 | 0.931 | 0.607 | 0.442 |
| 0.749999999999916 | 0.927 | 0.606 | 0.442 |
| 0.754999999999916 | 0.924 | 0.605 | 0.441 |
| 0.759999999999916 | 0.921 | 0.604 | 0.441 |
| 0.764999999999916 | 0.918 | 0.603 | 0.44 |
| 0.769999999999916 | 0.915 | 0.602 | 0.44 |
| 0.774999999999916 | 0.911 | 0.601 | 0.439 |
| 0.779999999999916 | 0.908 | 0.599 | 0.439 |
| 0.784999999999916 | 0.905 | 0.598 | 0.438 |
| 0.789999999999916 | 0.902 | 0.597 | 0.438 |
| 0.794999999999916 | 0.899 | 0.596 | 0.437 |
| 0.799999999999916 | 0.896 | 0.595 | 0.437 |
| 0.804999999999916 | 0.893 | 0.594 | 0.436 |
| 0.809999999999916 | 0.89 | 0.593 | 0.436 |
| 0.814999999999916 | 0.887 | 0.592 | 0.435 |
| 0.819999999999916 | 0.884 | 0.591 | 0.435 |
| 0.824999999999916 | 0.881 | 0.59 | 0.434 |
| 0.829999999999916 | 0.878 | 0.589 | 0.434 |
| 0.834999999999916 | 0.875 | 0.588 | 0.433 |
| 0.839999999999916 | 0.872 | 0.587 | 0.433 |
| 0.844999999999916 | 0.869 | 0.586 | 0.432 |
| 0.849999999999916 | 0.866 | 0.584 | 0.432 |
| 0.854999999999916 | 0.863 | 0.583 | 0.431 |
| 0.859999999999916 | 0.861 | 0.582 | 0.431 |
| 0.864999999999916 | 0.858 | 0.581 | 0.43 |
| 0.869999999999916 | 0.855 | 0.58 | 0.43 |
| 0.874999999999916 | 0.852 | 0.579 | 0.429 |
| 0.879999999999916 | 0.849 | 0.578 | 0.428 |
| 0.884999999999916 | 0.846 | 0.577 | 0.428 |
| 0.889999999999916 | 0.844 | 0.576 | 0.427 |
| 0.894999999999916 | 0.841 | 0.575 | 0.427 |
| 0.899999999999916 | 0.838 | 0.574 | 0.426 |
| 0.904999999999916 | 0.835 | 0.573 | 0.426 |
| 0.909999999999916 | 0.832 | 0.572 | 0.425 |
| 0.914999999999916 | 0.83 | 0.571 | 0.425 |
| 0.919999999999916 | 0.827 | 0.57 | 0.424 |
| 0.924999999999916 | 0.824 | 0.569 | 0.424 |
| 0.929999999999916 | 0.822 | 0.568 | 0.423 |
| 0.934999999999916 | 0.819 | 0.567 | 0.423 |
| 0.939999999999916 | 0.816 | 0.566 | 0.422 |
| 0.944999999999916 | 0.814 | 0.565 | 0.422 |
| 0.949999999999916 | 0.811 | 0.564 | 0.421 |
| 0.954999999999916 | 0.808 | 0.563 | 0.421 |
| 0.959999999999916 | 0.806 | 0.562 | 0.42 |
| 0.964999999999916 | 0.803 | 0.561 | 0.42 |
| 0.969999999999916 | 0.801 | 0.56 | 0.419 |
| 0.974999999999916 | 0.798 | 0.559 | 0.419 |
| 0.979999999999916 | 0.795 | 0.558 | 0.418 |
| 0.984999999999916 | 0.793 | 0.557 | 0.418 |
| 0.989999999999916 | 0.79 | 0.556 | 0.417 |
| 0.994999999999916 | 0.788 | 0.555 | 0.417 |
| 0.999999999999916 | 0.785 | 0.554 | 0.416 |
| 1.004999999999916 | 0.783 | 0.553 | 0.416 |
| 1.009999999999916 | 0.78 | 0.552 | 0.415 |
| 1.014999999999916 | 0.778 | 0.551 | 0.415 |
| 1.019999999999916 | 0.775 | 0.55 | 0.414 |
| 1.024999999999916 | 0.773 | 0.549 | 0.414 |
| 1.029999999999916 | 0.771 | 0.548 | 0.413 |
| 1.034999999999916 | 0.768 | 0.547 | 0.413 |
| 1.039999999999915 | 0.766 | 0.546 | 0.412 |
| 1.044999999999915 | 0.763 | 0.545 | 0.412 |
| 1.049999999999915 | 0.761 | 0.544 | 0.411 |
| 1.054999999999915 | 0.759 | 0.543 | 0.411 |
| 1.059999999999915 | 0.756 | 0.542 | 0.41 |
| 1.064999999999915 | 0.754 | 0.541 | 0.41 |
| 1.069999999999915 | 0.752 | 0.54 | 0.409 |
| 1.074999999999915 | 0.749 | 0.539 | 0.409 |
| 1.079999999999915 | 0.747 | 0.538 | 0.408 |
| 1.084999999999914 | 0.745 | 0.537 | 0.408 |
| 1.089999999999914 | 0.742 | 0.536 | 0.407 |
| 1.094999999999914 | 0.74 | 0.535 | 0.407 |
| 1.099999999999914 | 0.738 | 0.534 | 0.406 |
| 1.104999999999914 | 0.736 | 0.533 | 0.406 |
| 1.109999999999914 | 0.733 | 0.532 | 0.405 |
| 1.114999999999914 | 0.731 | 0.531 | 0.405 |
| 1.119999999999914 | 0.729 | 0.53 | 0.404 |
| 1.124999999999914 | 0.727 | 0.529 | 0.404 |
| 1.129999999999914 | 0.724 | 0.528 | 0.404 |
| 1.134999999999913 | 0.722 | 0.527 | 0.403 |
| 1.139999999999913 | 0.72 | 0.526 | 0.403 |
| 1.144999999999913 | 0.718 | 0.525 | 0.402 |
| 1.149999999999913 | 0.716 | 0.524 | 0.402 |
| 1.154999999999913 | 0.714 | 0.524 | 0.401 |
| 1.159999999999913 | 0.711 | 0.523 | 0.401 |
| 1.164999999999913 | 0.709 | 0.522 | 0.4 |
| 1.169999999999913 | 0.707 | 0.521 | 0.4 |
| 1.174999999999913 | 0.705 | 0.52 | 0.399 |
| 1.179999999999912 | 0.703 | 0.519 | 0.399 |
| 1.184999999999912 | 0.701 | 0.518 | 0.398 |
| 1.189999999999912 | 0.699 | 0.517 | 0.398 |
| 1.194999999999912 | 0.697 | 0.516 | 0.397 |
| 1.199999999999912 | 0.695 | 0.515 | 0.397 |
| 1.204999999999912 | 0.693 | 0.514 | 0.396 |
| 1.209999999999912 | 0.691 | 0.513 | 0.396 |
| 1.214999999999912 | 0.689 | 0.512 | 0.395 |
| 1.219999999999912 | 0.687 | 0.512 | 0.395 |
| 1.224999999999911 | 0.685 | 0.511 | 0.394 |
| 1.229999999999911 | 0.683 | 0.51 | 0.394 |
| 1.234999999999911 | 0.681 | 0.509 | 0.393 |
| 1.239999999999911 | 0.679 | 0.508 | 0.393 |
| 1.244999999999911 | 0.677 | 0.507 | 0.392 |
| 1.249999999999911 | 0.675 | 0.506 | 0.392 |
| 1.254999999999911 | 0.673 | 0.505 | 0.392 |
| 1.259999999999911 | 0.671 | 0.504 | 0.391 |
| 1.264999999999911 | 0.669 | 0.503 | 0.391 |
| 1.269999999999911 | 0.667 | 0.503 | 0.39 |
| 1.27499999999991 | 0.665 | 0.502 | 0.39 |
| 1.27999999999991 | 0.663 | 0.501 | 0.389 |
| 1.28499999999991 | 0.661 | 0.5 | 0.389 |
| 1.28999999999991 | 0.659 | 0.499 | 0.388 |
| 1.29499999999991 | 0.658 | 0.498 | 0.388 |
| 1.29999999999991 | 0.656 | 0.497 | 0.387 |
| 1.30499999999991 | 0.654 | 0.496 | 0.387 |
| 1.30999999999991 | 0.652 | 0.495 | 0.386 |
| 1.31499999999991 | 0.65 | 0.495 | 0.386 |
| 1.319999999999909 | 0.648 | 0.494 | 0.385 |
| 1.324999999999909 | 0.647 | 0.493 | 0.385 |
| 1.329999999999909 | 0.645 | 0.492 | 0.385 |
| 1.334999999999909 | 0.643 | 0.491 | 0.384 |
| 1.339999999999909 | 0.641 | 0.49 | 0.384 |
| 1.344999999999909 | 0.639 | 0.489 | 0.383 |
| 1.349999999999909 | 0.638 | 0.489 | 0.383 |
| 1.354999999999909 | 0.636 | 0.488 | 0.382 |
| 1.359999999999909 | 0.634 | 0.487 | 0.382 |
| 1.364999999999908 | 0.632 | 0.486 | 0.381 |
| 1.369999999999908 | 0.631 | 0.485 | 0.381 |
| 1.374999999999908 | 0.629 | 0.484 | 0.38 |
| 1.379999999999908 | 0.627 | 0.483 | 0.38 |
| 1.384999999999908 | 0.625 | 0.483 | 0.379 |
| 1.389999999999908 | 0.624 | 0.482 | 0.379 |
| 1.394999999999908 | 0.622 | 0.481 | 0.379 |
| 1.399999999999908 | 0.62 | 0.48 | 0.378 |
| 1.404999999999908 | 0.619 | 0.479 | 0.378 |
| 1.409999999999908 | 0.617 | 0.478 | 0.377 |
| 1.414999999999907 | 0.615 | 0.478 | 0.377 |
| 1.419999999999907 | 0.614 | 0.477 | 0.376 |
| 1.424999999999907 | 0.612 | 0.476 | 0.376 |
| 1.429999999999907 | 0.61 | 0.475 | 0.375 |
| 1.434999999999907 | 0.609 | 0.474 | 0.375 |
| 1.439999999999907 | 0.607 | 0.473 | 0.374 |
| 1.444999999999907 | 0.605 | 0.473 | 0.374 |
| 1.449999999999907 | 0.604 | 0.472 | 0.374 |
| 1.454999999999907 | 0.602 | 0.471 | 0.373 |
| 1.459999999999906 | 0.601 | 0.47 | 0.373 |
| 1.464999999999906 | 0.599 | 0.469 | 0.372 |
| 1.469999999999906 | 0.597 | 0.468 | 0.372 |
| 1.474999999999906 | 0.596 | 0.468 | 0.371 |
| 1.479999999999906 | 0.594 | 0.467 | 0.371 |
| 1.484999999999906 | 0.593 | 0.466 | 0.37 |
| 1.489999999999906 | 0.591 | 0.465 | 0.37 |
| 1.494999999999906 | 0.59 | 0.464 | 0.369 |
| 1.499999999999906 | 0.588 | 0.464 | 0.369 |
| 1.504999999999906 | 0.586 | 0.463 | 0.369 |
| 1.509999999999905 | 0.585 | 0.462 | 0.368 |
| 1.514999999999905 | 0.583 | 0.461 | 0.368 |
| 1.519999999999905 | 0.582 | 0.46 | 0.367 |
| 1.524999999999905 | 0.58 | 0.46 | 0.367 |
| 1.529999999999905 | 0.579 | 0.459 | 0.366 |
| 1.534999999999905 | 0.577 | 0.458 | 0.366 |
| 1.539999999999905 | 0.576 | 0.457 | 0.366 |
| 1.544999999999905 | 0.574 | 0.457 | 0.365 |
| 1.549999999999905 | 0.573 | 0.456 | 0.365 |
| 1.554999999999904 | 0.571 | 0.455 | 0.364 |
| 1.559999999999904 | 0.57 | 0.454 | 0.364 |
| 1.564999999999904 | 0.569 | 0.453 | 0.363 |
| 1.569999999999904 | 0.567 | 0.453 | 0.363 |
| 1.574999999999904 | 0.566 | 0.452 | 0.362 |
| 1.579999999999904 | 0.564 | 0.451 | 0.362 |
| 1.584999999999904 | 0.563 | 0.45 | 0.362 |
| 1.589999999999904 | 0.561 | 0.45 | 0.361 |
| 1.594999999999904 | 0.56 | 0.449 | 0.361 |
| 1.599999999999903 | 0.559 | 0.448 | 0.36 |
| 1.604999999999903 | 0.557 | 0.447 | 0.36 |
| 1.609999999999903 | 0.556 | 0.447 | 0.359 |
| 1.614999999999903 | 0.554 | 0.446 | 0.359 |
| 1.619999999999903 | 0.553 | 0.445 | 0.359 |
| 1.624999999999903 | 0.552 | 0.444 | 0.358 |
| 1.629999999999903 | 0.55 | 0.443 | 0.358 |
| 1.634999999999903 | 0.549 | 0.443 | 0.357 |
| 1.639999999999903 | 0.548 | 0.442 | 0.357 |
| 1.644999999999902 | 0.546 | 0.441 | 0.356 |
| 1.649999999999902 | 0.545 | 0.44 | 0.356 |
| 1.654999999999902 | 0.544 | 0.44 | 0.356 |
| 1.659999999999902 | 0.542 | 0.439 | 0.355 |
| 1.664999999999902 | 0.541 | 0.438 | 0.355 |
| 1.669999999999902 | 0.54 | 0.438 | 0.354 |
| 1.674999999999902 | 0.538 | 0.437 | 0.354 |
| 1.679999999999902 | 0.537 | 0.436 | 0.353 |
| 1.684999999999902 | 0.536 | 0.435 | 0.353 |
| 1.689999999999901 | 0.534 | 0.435 | 0.353 |
| 1.694999999999901 | 0.533 | 0.434 | 0.352 |
| 1.699999999999901 | 0.532 | 0.433 | 0.352 |
| 1.704999999999901 | 0.53 | 0.432 | 0.351 |
| 1.709999999999901 | 0.529 | 0.432 | 0.351 |
| 1.714999999999901 | 0.528 | 0.431 | 0.35 |
| 1.719999999999901 | 0.527 | 0.43 | 0.35 |
| 1.724999999999901 | 0.525 | 0.43 | 0.35 |
| 1.729999999999901 | 0.524 | 0.429 | 0.349 |
| 1.734999999999901 | 0.523 | 0.428 | 0.349 |
| 1.7399999999999 | 0.522 | 0.427 | 0.348 |
| 1.7449999999999 | 0.52 | 0.427 | 0.348 |
| 1.7499999999999 | 0.519 | 0.426 | 0.348 |
| 1.7549999999999 | 0.518 | 0.425 | 0.347 |
| 1.7599999999999 | 0.517 | 0.425 | 0.347 |
| 1.7649999999999 | 0.515 | 0.424 | 0.346 |
| 1.7699999999999 | 0.514 | 0.423 | 0.346 |
| 1.7749999999999 | 0.513 | 0.422 | 0.346 |
| 1.7799999999999 | 0.512 | 0.422 | 0.345 |
| 1.784999999999899 | 0.511 | 0.421 | 0.345 |
| 1.789999999999899 | 0.509 | 0.42 | 0.344 |
| 1.794999999999899 | 0.508 | 0.42 | 0.344 |
| 1.799999999999899 | 0.507 | 0.419 | 0.343 |
| 1.804999999999899 | 0.506 | 0.418 | 0.343 |
| 1.809999999999899 | 0.505 | 0.418 | 0.343 |
| 1.814999999999899 | 0.504 | 0.417 | 0.342 |
| 1.819999999999899 | 0.502 | 0.416 | 0.342 |
| 1.824999999999899 | 0.501 | 0.416 | 0.341 |
| 1.829999999999899 | 0.5 | 0.415 | 0.341 |
| 1.834999999999898 | 0.499 | 0.414 | 0.341 |
| 1.839999999999898 | 0.498 | 0.414 | 0.34 |
| 1.844999999999898 | 0.497 | 0.413 | 0.34 |
| 1.849999999999898 | 0.496 | 0.412 | 0.339 |
| 1.854999999999898 | 0.494 | 0.411 | 0.339 |
| 1.859999999999898 | 0.493 | 0.411 | 0.339 |
| 1.864999999999898 | 0.492 | 0.41 | 0.338 |
| 1.869999999999898 | 0.491 | 0.409 | 0.338 |
| 1.874999999999898 | 0.49 | 0.409 | 0.337 |
| 1.879999999999897 | 0.489 | 0.408 | 0.337 |
| 1.884999999999897 | 0.488 | 0.407 | 0.337 |
| 1.889999999999897 | 0.487 | 0.407 | 0.336 |
| 1.894999999999897 | 0.486 | 0.406 | 0.336 |
| 1.899999999999897 | 0.484 | 0.406 | 0.335 |
| 1.904999999999897 | 0.483 | 0.405 | 0.335 |
| 1.909999999999897 | 0.482 | 0.404 | 0.335 |
| 1.914999999999897 | 0.481 | 0.404 | 0.334 |
| 1.919999999999897 | 0.48 | 0.403 | 0.334 |
| 1.924999999999897 | 0.479 | 0.402 | 0.333 |
| 1.929999999999896 | 0.478 | 0.402 | 0.333 |
| 1.934999999999896 | 0.477 | 0.401 | 0.333 |
| 1.939999999999896 | 0.476 | 0.4 | 0.332 |
| 1.944999999999896 | 0.475 | 0.4 | 0.332 |
| 1.949999999999896 | 0.474 | 0.399 | 0.331 |
| 1.954999999999896 | 0.473 | 0.398 | 0.331 |
| 1.959999999999896 | 0.472 | 0.398 | 0.331 |
| 1.964999999999896 | 0.471 | 0.397 | 0.33 |
| 1.969999999999896 | 0.47 | 0.396 | 0.33 |
| 1.974999999999895 | 0.469 | 0.396 | 0.33 |
| 1.979999999999895 | 0.468 | 0.395 | 0.329 |
| 1.984999999999895 | 0.467 | 0.395 | 0.329 |
| 1.989999999999895 | 0.466 | 0.394 | 0.328 |
| 1.994999999999895 | 0.465 | 0.393 | 0.328 |
| 1.999999999999895 | 0.464 | 0.393 | 0.328 |
| 2.004999999999895 | 0.463 | 0.392 | 0.327 |
| 2.009999999999895 | 0.462 | 0.391 | 0.327 |
| 2.014999999999895 | 0.461 | 0.391 | 0.326 |
| 2.019999999999895 | 0.46 | 0.39 | 0.326 |
| 2.024999999999895 | 0.459 | 0.39 | 0.326 |
| 2.029999999999895 | 0.458 | 0.389 | 0.325 |
| 2.034999999999894 | 0.457 | 0.388 | 0.325 |
| 2.039999999999894 | 0.456 | 0.388 | 0.325 |
| 2.044999999999894 | 0.455 | 0.387 | 0.324 |
| 2.049999999999894 | 0.454 | 0.387 | 0.324 |
| 2.054999999999894 | 0.453 | 0.386 | 0.323 |
| 2.059999999999894 | 0.452 | 0.385 | 0.323 |
| 2.064999999999894 | 0.451 | 0.385 | 0.323 |
| 2.069999999999894 | 0.45 | 0.384 | 0.322 |
| 2.074999999999894 | 0.449 | 0.383 | 0.322 |
| 2.079999999999893 | 0.448 | 0.383 | 0.322 |
| 2.084999999999893 | 0.447 | 0.382 | 0.321 |
| 2.089999999999893 | 0.446 | 0.382 | 0.321 |
| 2.094999999999893 | 0.445 | 0.381 | 0.32 |
| 2.099999999999893 | 0.444 | 0.381 | 0.32 |
| 2.104999999999893 | 0.443 | 0.38 | 0.32 |
| 2.109999999999893 | 0.443 | 0.379 | 0.319 |
| 2.114999999999893 | 0.442 | 0.379 | 0.319 |
| 2.119999999999893 | 0.441 | 0.378 | 0.319 |
| 2.124999999999893 | 0.44 | 0.378 | 0.318 |
| 2.129999999999892 | 0.439 | 0.377 | 0.318 |
| 2.134999999999892 | 0.438 | 0.376 | 0.317 |
| 2.139999999999892 | 0.437 | 0.376 | 0.317 |
| 2.144999999999892 | 0.436 | 0.375 | 0.317 |
| 2.149999999999892 | 0.435 | 0.375 | 0.316 |
| 2.154999999999892 | 0.434 | 0.374 | 0.316 |
| 2.159999999999892 | 0.434 | 0.373 | 0.316 |
| 2.164999999999892 | 0.433 | 0.373 | 0.315 |
| 2.169999999999892 | 0.432 | 0.372 | 0.315 |
| 2.174999999999891 | 0.431 | 0.372 | 0.314 |
| 2.179999999999891 | 0.43 | 0.371 | 0.314 |
| 2.184999999999891 | 0.429 | 0.371 | 0.314 |
| 2.189999999999891 | 0.428 | 0.37 | 0.313 |
| 2.194999999999891 | 0.427 | 0.369 | 0.313 |
| 2.199999999999891 | 0.427 | 0.369 | 0.313 |
| 2.204999999999891 | 0.426 | 0.368 | 0.312 |
| 2.209999999999891 | 0.425 | 0.368 | 0.312 |
| 2.214999999999891 | 0.424 | 0.367 | 0.312 |
| 2.21999999999989 | 0.423 | 0.367 | 0.311 |
| 2.22499999999989 | 0.422 | 0.366 | 0.311 |
| 2.22999999999989 | 0.422 | 0.366 | 0.311 |
| 2.23499999999989 | 0.421 | 0.365 | 0.31 |
| 2.23999999999989 | 0.42 | 0.364 | 0.31 |
| 2.24499999999989 | 0.419 | 0.364 | 0.309 |
| 2.24999999999989 | 0.418 | 0.363 | 0.309 |
| 2.25499999999989 | 0.417 | 0.363 | 0.309 |
| 2.25999999999989 | 0.417 | 0.362 | 0.308 |
| 2.26499999999989 | 0.416 | 0.362 | 0.308 |
| 2.269999999999889 | 0.415 | 0.361 | 0.308 |
| 2.274999999999889 | 0.414 | 0.361 | 0.307 |
| 2.279999999999889 | 0.413 | 0.36 | 0.307 |
| 2.284999999999889 | 0.413 | 0.359 | 0.307 |
| 2.289999999999889 | 0.412 | 0.359 | 0.306 |
| 2.294999999999889 | 0.411 | 0.358 | 0.306 |
| 2.299999999999889 | 0.41 | 0.358 | 0.306 |
| 2.304999999999889 | 0.409 | 0.357 | 0.305 |
| 2.309999999999889 | 0.409 | 0.357 | 0.305 |
| 2.314999999999888 | 0.408 | 0.356 | 0.305 |
| 2.319999999999888 | 0.407 | 0.356 | 0.304 |
| 2.324999999999888 | 0.406 | 0.355 | 0.304 |
| 2.329999999999888 | 0.405 | 0.355 | 0.303 |
| 2.334999999999888 | 0.405 | 0.354 | 0.303 |
| 2.339999999999888 | 0.404 | 0.354 | 0.303 |
| 2.344999999999888 | 0.403 | 0.353 | 0.302 |
| 2.349999999999888 | 0.402 | 0.353 | 0.302 |
| 2.354999999999888 | 0.402 | 0.352 | 0.302 |
| 2.359999999999887 | 0.401 | 0.352 | 0.301 |
| 2.364999999999887 | 0.4 | 0.351 | 0.301 |
| 2.369999999999887 | 0.399 | 0.35 | 0.301 |
| 2.374999999999887 | 0.399 | 0.35 | 0.3 |
| 2.379999999999887 | 0.398 | 0.349 | 0.3 |
| 2.384999999999887 | 0.397 | 0.349 | 0.3 |
| 2.389999999999887 | 0.396 | 0.348 | 0.299 |
| 2.394999999999887 | 0.396 | 0.348 | 0.299 |
| 2.399999999999887 | 0.395 | 0.347 | 0.299 |
| 2.404999999999887 | 0.394 | 0.347 | 0.298 |
| 2.409999999999886 | 0.393 | 0.346 | 0.298 |
| 2.414999999999886 | 0.393 | 0.346 | 0.298 |
| 2.419999999999886 | 0.392 | 0.345 | 0.297 |
| 2.424999999999886 | 0.391 | 0.345 | 0.297 |
| 2.429999999999886 | 0.39 | 0.344 | 0.297 |
| 2.434999999999886 | 0.39 | 0.344 | 0.296 |
| 2.439999999999886 | 0.389 | 0.343 | 0.296 |
| 2.444999999999886 | 0.388 | 0.343 | 0.296 |
| 2.449999999999886 | 0.388 | 0.342 | 0.295 |
| 2.454999999999885 | 0.387 | 0.342 | 0.295 |
| 2.459999999999885 | 0.386 | 0.341 | 0.295 |
| 2.464999999999885 | 0.385 | 0.341 | 0.294 |
| 2.469999999999885 | 0.385 | 0.34 | 0.294 |
| 2.474999999999885 | 0.384 | 0.34 | 0.294 |
| 2.479999999999885 | 0.383 | 0.339 | 0.293 |
| 2.484999999999885 | 0.383 | 0.339 | 0.293 |
| 2.489999999999885 | 0.382 | 0.338 | 0.293 |
| 2.494999999999885 | 0.381 | 0.338 | 0.292 |
| 2.499999999999884 | 0.381 | 0.337 | 0.292 |
| 2.504999999999884 | 0.38 | 0.337 | 0.292 |
| 2.509999999999884 | 0.379 | 0.336 | 0.291 |
| 2.514999999999884 | 0.378 | 0.336 | 0.291 |
| 2.519999999999884 | 0.378 | 0.335 | 0.291 |
| 2.524999999999884 | 0.377 | 0.335 | 0.29 |
| 2.529999999999884 | 0.376 | 0.334 | 0.29 |
| 2.534999999999884 | 0.376 | 0.334 | 0.29 |
| 2.539999999999884 | 0.375 | 0.334 | 0.289 |
| 2.544999999999884 | 0.374 | 0.333 | 0.289 |
| 2.549999999999883 | 0.374 | 0.333 | 0.289 |
| 2.554999999999883 | 0.373 | 0.332 | 0.288 |
| 2.559999999999883 | 0.372 | 0.332 | 0.288 |
| 2.564999999999883 | 0.372 | 0.331 | 0.288 |
| 2.569999999999883 | 0.371 | 0.331 | 0.287 |
| 2.574999999999883 | 0.37 | 0.33 | 0.287 |
| 2.579999999999883 | 0.37 | 0.33 | 0.287 |
| 2.584999999999883 | 0.369 | 0.329 | 0.287 |
| 2.589999999999883 | 0.368 | 0.329 | 0.286 |
| 2.594999999999882 | 0.368 | 0.328 | 0.286 |
| 2.599999999999882 | 0.367 | 0.328 | 0.286 |
| 2.604999999999882 | 0.367 | 0.327 | 0.285 |
| 2.609999999999882 | 0.366 | 0.327 | 0.285 |
| 2.614999999999882 | 0.365 | 0.326 | 0.285 |
| 2.619999999999882 | 0.365 | 0.326 | 0.284 |
| 2.624999999999882 | 0.364 | 0.326 | 0.284 |
| 2.629999999999882 | 0.363 | 0.325 | 0.284 |
| 2.634999999999882 | 0.363 | 0.325 | 0.283 |
| 2.639999999999881 | 0.362 | 0.324 | 0.283 |
| 2.644999999999881 | 0.361 | 0.324 | 0.283 |
| 2.649999999999881 | 0.361 | 0.323 | 0.282 |
| 2.654999999999881 | 0.36 | 0.323 | 0.282 |
| 2.659999999999881 | 0.36 | 0.322 | 0.282 |
| 2.664999999999881 | 0.359 | 0.322 | 0.281 |
| 2.669999999999881 | 0.358 | 0.321 | 0.281 |
| 2.674999999999881 | 0.358 | 0.321 | 0.281 |
| 2.679999999999881 | 0.357 | 0.321 | 0.281 |
| 2.68499999999988 | 0.357 | 0.32 | 0.28 |
| 2.68999999999988 | 0.356 | 0.32 | 0.28 |
| 2.69499999999988 | 0.355 | 0.319 | 0.28 |
| 2.69999999999988 | 0.355 | 0.319 | 0.279 |
| 2.70499999999988 | 0.354 | 0.318 | 0.279 |
| 2.70999999999988 | 0.354 | 0.318 | 0.279 |
| 2.71499999999988 | 0.353 | 0.317 | 0.278 |
| 2.71999999999988 | 0.352 | 0.317 | 0.278 |
| 2.72499999999988 | 0.352 | 0.317 | 0.278 |
| 2.72999999999988 | 0.351 | 0.316 | 0.277 |
| 2.734999999999879 | 0.351 | 0.316 | 0.277 |
| 2.739999999999879 | 0.35 | 0.315 | 0.277 |
| 2.744999999999879 | 0.349 | 0.315 | 0.277 |
| 2.749999999999879 | 0.349 | 0.314 | 0.276 |
| 2.754999999999879 | 0.348 | 0.314 | 0.276 |
| 2.759999999999879 | 0.348 | 0.314 | 0.276 |
| 2.764999999999879 | 0.347 | 0.313 | 0.275 |
| 2.769999999999879 | 0.346 | 0.313 | 0.275 |
| 2.774999999999879 | 0.346 | 0.312 | 0.275 |
| 2.779999999999878 | 0.345 | 0.312 | 0.274 |
| 2.784999999999878 | 0.345 | 0.311 | 0.274 |
| 2.789999999999878 | 0.344 | 0.311 | 0.274 |
| 2.794999999999878 | 0.344 | 0.311 | 0.274 |
| 2.799999999999878 | 0.343 | 0.31 | 0.273 |
| 2.804999999999878 | 0.342 | 0.31 | 0.273 |
| 2.809999999999878 | 0.342 | 0.309 | 0.273 |
| 2.814999999999878 | 0.341 | 0.309 | 0.272 |
| 2.819999999999878 | 0.341 | 0.308 | 0.272 |
| 2.824999999999878 | 0.34 | 0.308 | 0.272 |
| 2.829999999999877 | 0.34 | 0.308 | 0.272 |
| 2.834999999999877 | 0.339 | 0.307 | 0.271 |
| 2.839999999999877 | 0.339 | 0.307 | 0.271 |
| 2.844999999999877 | 0.338 | 0.306 | 0.271 |
| 2.849999999999877 | 0.337 | 0.306 | 0.27 |
| 2.854999999999877 | 0.337 | 0.306 | 0.27 |
| 2.859999999999877 | 0.336 | 0.305 | 0.27 |
| 2.864999999999877 | 0.336 | 0.305 | 0.269 |
| 2.869999999999877 | 0.335 | 0.304 | 0.269 |
| 2.874999999999876 | 0.335 | 0.304 | 0.269 |
| 2.879999999999876 | 0.334 | 0.303 | 0.269 |
| 2.884999999999876 | 0.334 | 0.303 | 0.268 |
| 2.889999999999876 | 0.333 | 0.303 | 0.268 |
| 2.894999999999876 | 0.333 | 0.302 | 0.268 |
| 2.899999999999876 | 0.332 | 0.302 | 0.267 |
| 2.904999999999876 | 0.332 | 0.301 | 0.267 |
| 2.909999999999876 | 0.331 | 0.301 | 0.267 |
| 2.914999999999876 | 0.33 | 0.301 | 0.267 |
| 2.919999999999876 | 0.33 | 0.3 | 0.266 |
| 2.924999999999875 | 0.329 | 0.3 | 0.266 |
| 2.929999999999875 | 0.329 | 0.299 | 0.266 |
| 2.934999999999875 | 0.328 | 0.299 | 0.265 |
| 2.939999999999875 | 0.328 | 0.299 | 0.265 |
| 2.944999999999875 | 0.327 | 0.298 | 0.265 |
| 2.949999999999875 | 0.327 | 0.298 | 0.265 |
| 2.954999999999875 | 0.326 | 0.297 | 0.264 |
| 2.959999999999875 | 0.326 | 0.297 | 0.264 |
| 2.964999999999875 | 0.325 | 0.297 | 0.264 |
| 2.969999999999874 | 0.325 | 0.296 | 0.263 |
| 2.974999999999874 | 0.324 | 0.296 | 0.263 |
| 2.979999999999874 | 0.324 | 0.296 | 0.263 |
| 2.984999999999874 | 0.323 | 0.295 | 0.263 |
| 2.989999999999874 | 0.323 | 0.295 | 0.262 |
| 2.994999999999874 | 0.322 | 0.294 | 0.262 |
| 2.999999999999874 | 0.322 | 0.294 | 0.262 |
| 3.004999999999874 | 0.321 | 0.294 | 0.262 |
| 3.009999999999874 | 0.321 | 0.293 | 0.261 |
| 3.014999999999874 | 0.32 | 0.293 | 0.261 |
| 3.019999999999873 | 0.32 | 0.292 | 0.261 |
| 3.024999999999873 | 0.319 | 0.292 | 0.26 |
| 3.029999999999873 | 0.319 | 0.292 | 0.26 |
| 3.034999999999873 | 0.318 | 0.291 | 0.26 |
| 3.039999999999873 | 0.318 | 0.291 | 0.26 |
| 3.044999999999873 | 0.317 | 0.291 | 0.259 |
| 3.049999999999873 | 0.317 | 0.29 | 0.259 |
| 3.054999999999873 | 0.316 | 0.29 | 0.259 |
| 3.059999999999873 | 0.316 | 0.289 | 0.258 |
| 3.064999999999872 | 0.315 | 0.289 | 0.258 |
| 3.069999999999872 | 0.315 | 0.289 | 0.258 |
| 3.074999999999872 | 0.314 | 0.288 | 0.258 |
| 3.079999999999872 | 0.314 | 0.288 | 0.257 |
| 3.084999999999872 | 0.313 | 0.288 | 0.257 |
| 3.089999999999872 | 0.313 | 0.287 | 0.257 |
| 3.094999999999872 | 0.313 | 0.287 | 0.257 |
| 3.099999999999872 | 0.312 | 0.286 | 0.256 |
| 3.104999999999872 | 0.312 | 0.286 | 0.256 |
| 3.109999999999872 | 0.311 | 0.286 | 0.256 |
| 3.114999999999871 | 0.311 | 0.285 | 0.256 |
| 3.119999999999871 | 0.31 | 0.285 | 0.255 |
| 3.124999999999871 | 0.31 | 0.285 | 0.255 |
| 3.129999999999871 | 0.309 | 0.284 | 0.255 |
| 3.134999999999871 | 0.309 | 0.284 | 0.254 |
| 3.139999999999871 | 0.308 | 0.284 | 0.254 |
| 3.144999999999871 | 0.308 | 0.283 | 0.254 |
| 3.149999999999871 | 0.307 | 0.283 | 0.254 |
| 3.154999999999871 | 0.307 | 0.282 | 0.253 |
| 3.15999999999987 | 0.306 | 0.282 | 0.253 |
| 3.16499999999987 | 0.306 | 0.282 | 0.253 |
| 3.16999999999987 | 0.306 | 0.281 | 0.253 |
| 3.17499999999987 | 0.305 | 0.281 | 0.252 |
| 3.17999999999987 | 0.305 | 0.281 | 0.252 |
| 3.18499999999987 | 0.304 | 0.28 | 0.252 |
| 3.18999999999987 | 0.304 | 0.28 | 0.252 |
| 3.19499999999987 | 0.303 | 0.28 | 0.251 |
| 3.19999999999987 | 0.303 | 0.279 | 0.251 |
| 3.204999999999869 | 0.302 | 0.279 | 0.251 |
| 3.209999999999869 | 0.302 | 0.279 | 0.251 |
| 3.214999999999869 | 0.302 | 0.278 | 0.25 |
| 3.219999999999869 | 0.301 | 0.278 | 0.25 |
| 3.224999999999869 | 0.301 | 0.278 | 0.25 |
| 3.229999999999869 | 0.3 | 0.277 | 0.249 |
| 3.234999999999869 | 0.3 | 0.277 | 0.249 |
| 3.239999999999869 | 0.299 | 0.277 | 0.249 |
| 3.244999999999869 | 0.299 | 0.276 | 0.249 |
| 3.249999999999869 | 0.298 | 0.276 | 0.248 |
| 3.254999999999868 | 0.298 | 0.275 | 0.248 |
| 3.259999999999868 | 0.298 | 0.275 | 0.248 |
| 3.264999999999868 | 0.297 | 0.275 | 0.248 |
| 3.269999999999868 | 0.297 | 0.274 | 0.247 |
| 3.274999999999868 | 0.296 | 0.274 | 0.247 |
| 3.279999999999868 | 0.296 | 0.274 | 0.247 |
| 3.284999999999868 | 0.296 | 0.273 | 0.247 |
| 3.289999999999868 | 0.295 | 0.273 | 0.246 |
| 3.294999999999868 | 0.295 | 0.273 | 0.246 |
| 3.299999999999867 | 0.294 | 0.272 | 0.246 |
| 3.304999999999867 | 0.294 | 0.272 | 0.246 |
| 3.309999999999867 | 0.293 | 0.272 | 0.245 |
| 3.314999999999867 | 0.293 | 0.271 | 0.245 |
| 3.319999999999867 | 0.293 | 0.271 | 0.245 |
| 3.324999999999867 | 0.292 | 0.271 | 0.245 |
| 3.329999999999867 | 0.292 | 0.27 | 0.244 |
| 3.334999999999867 | 0.291 | 0.27 | 0.244 |
| 3.339999999999867 | 0.291 | 0.27 | 0.244 |
| 3.344999999999866 | 0.29 | 0.269 | 0.244 |
| 3.349999999999866 | 0.29 | 0.269 | 0.243 |
| 3.354999999999866 | 0.29 | 0.269 | 0.243 |
| 3.359999999999866 | 0.289 | 0.268 | 0.243 |
| 3.364999999999866 | 0.289 | 0.268 | 0.243 |
| 3.369999999999866 | 0.288 | 0.268 | 0.242 |
| 3.374999999999866 | 0.288 | 0.267 | 0.242 |
| 3.379999999999866 | 0.288 | 0.267 | 0.242 |
| 3.384999999999866 | 0.287 | 0.267 | 0.242 |
| 3.389999999999866 | 0.287 | 0.267 | 0.241 |
| 3.394999999999865 | 0.286 | 0.266 | 0.241 |
| 3.399999999999865 | 0.286 | 0.266 | 0.241 |
| 3.404999999999865 | 0.286 | 0.266 | 0.241 |
| 3.409999999999865 | 0.285 | 0.265 | 0.241 |
| 3.414999999999865 | 0.285 | 0.265 | 0.24 |
| 3.419999999999865 | 0.284 | 0.265 | 0.24 |
| 3.424999999999865 | 0.284 | 0.264 | 0.24 |
| 3.429999999999865 | 0.284 | 0.264 | 0.24 |
| 3.434999999999865 | 0.283 | 0.264 | 0.239 |
| 3.439999999999864 | 0.283 | 0.263 | 0.239 |
| 3.444999999999864 | 0.283 | 0.263 | 0.239 |
| 3.449999999999864 | 0.282 | 0.263 | 0.239 |
| 3.454999999999864 | 0.282 | 0.262 | 0.238 |
| 3.459999999999864 | 0.281 | 0.262 | 0.238 |
| 3.464999999999864 | 0.281 | 0.262 | 0.238 |
| 3.469999999999864 | 0.281 | 0.261 | 0.238 |
| 3.474999999999864 | 0.28 | 0.261 | 0.237 |
| 3.479999999999864 | 0.28 | 0.261 | 0.237 |
| 3.484999999999864 | 0.279 | 0.26 | 0.237 |
| 3.489999999999863 | 0.279 | 0.26 | 0.237 |
| 3.494999999999863 | 0.279 | 0.26 | 0.236 |
| 3.499999999999863 | 0.278 | 0.26 | 0.236 |
| 3.504999999999863 | 0.278 | 0.259 | 0.236 |
| 3.509999999999863 | 0.278 | 0.259 | 0.236 |
| 3.514999999999863 | 0.277 | 0.259 | 0.236 |
| 3.519999999999863 | 0.277 | 0.258 | 0.235 |
| 3.524999999999863 | 0.276 | 0.258 | 0.235 |
| 3.529999999999863 | 0.276 | 0.258 | 0.235 |
| 3.534999999999862 | 0.276 | 0.257 | 0.235 |
| 3.539999999999862 | 0.275 | 0.257 | 0.234 |
| 3.544999999999862 | 0.275 | 0.257 | 0.234 |
| 3.549999999999862 | 0.275 | 0.257 | 0.234 |
| 3.554999999999862 | 0.274 | 0.256 | 0.234 |
| 3.559999999999862 | 0.274 | 0.256 | 0.233 |
| 3.564999999999862 | 0.273 | 0.256 | 0.233 |
| 3.569999999999862 | 0.273 | 0.255 | 0.233 |
| 3.574999999999862 | 0.273 | 0.255 | 0.233 |
| 3.579999999999862 | 0.272 | 0.255 | 0.232 |
| 3.584999999999861 | 0.272 | 0.254 | 0.232 |
| 3.589999999999861 | 0.272 | 0.254 | 0.232 |
| 3.594999999999861 | 0.271 | 0.254 | 0.232 |
| 3.599999999999861 | 0.271 | 0.254 | 0.232 |
| 3.604999999999861 | 0.271 | 0.253 | 0.231 |
| 3.609999999999861 | 0.27 | 0.253 | 0.231 |
| 3.614999999999861 | 0.27 | 0.253 | 0.231 |
| 3.619999999999861 | 0.27 | 0.252 | 0.231 |
| 3.62499999999986 | 0.269 | 0.252 | 0.23 |
| 3.62999999999986 | 0.269 | 0.252 | 0.23 |
| 3.63499999999986 | 0.268 | 0.252 | 0.23 |
| 3.63999999999986 | 0.268 | 0.251 | 0.23 |
| 3.64499999999986 | 0.268 | 0.251 | 0.23 |
| 3.64999999999986 | 0.267 | 0.251 | 0.229 |
| 3.65499999999986 | 0.267 | 0.25 | 0.229 |
| 3.65999999999986 | 0.267 | 0.25 | 0.229 |
| 3.66499999999986 | 0.266 | 0.25 | 0.229 |
| 3.669999999999859 | 0.266 | 0.249 | 0.228 |
| 3.674999999999859 | 0.266 | 0.249 | 0.228 |
| 3.679999999999859 | 0.265 | 0.249 | 0.228 |
| 3.684999999999859 | 0.265 | 0.249 | 0.228 |
| 3.689999999999859 | 0.265 | 0.248 | 0.228 |
| 3.694999999999859 | 0.264 | 0.248 | 0.227 |
| 3.699999999999859 | 0.264 | 0.248 | 0.227 |
| 3.704999999999859 | 0.264 | 0.247 | 0.227 |
| 3.709999999999859 | 0.263 | 0.247 | 0.227 |
| 3.714999999999859 | 0.263 | 0.247 | 0.226 |
| 3.719999999999858 | 0.263 | 0.247 | 0.226 |
| 3.724999999999858 | 0.262 | 0.246 | 0.226 |
| 3.729999999999858 | 0.262 | 0.246 | 0.226 |
| 3.734999999999858 | 0.262 | 0.246 | 0.226 |
| 3.739999999999858 | 0.261 | 0.246 | 0.225 |
| 3.744999999999858 | 0.261 | 0.245 | 0.225 |
| 3.749999999999858 | 0.261 | 0.245 | 0.225 |
| 3.754999999999858 | 0.26 | 0.245 | 0.225 |
| 3.759999999999858 | 0.26 | 0.244 | 0.224 |
| 3.764999999999857 | 0.26 | 0.244 | 0.224 |
| 3.769999999999857 | 0.259 | 0.244 | 0.224 |
| 3.774999999999857 | 0.259 | 0.244 | 0.224 |
| 3.779999999999857 | 0.259 | 0.243 | 0.224 |
| 3.784999999999857 | 0.258 | 0.243 | 0.223 |
| 3.789999999999857 | 0.258 | 0.243 | 0.223 |
| 3.794999999999857 | 0.258 | 0.243 | 0.223 |
| 3.799999999999857 | 0.257 | 0.242 | 0.223 |
| 3.804999999999857 | 0.257 | 0.242 | 0.223 |
| 3.809999999999857 | 0.257 | 0.242 | 0.222 |
| 3.814999999999856 | 0.256 | 0.241 | 0.222 |
| 3.819999999999856 | 0.256 | 0.241 | 0.222 |
| 3.824999999999856 | 0.256 | 0.241 | 0.222 |
| 3.829999999999856 | 0.255 | 0.241 | 0.221 |
| 3.834999999999856 | 0.255 | 0.24 | 0.221 |
| 3.839999999999856 | 0.255 | 0.24 | 0.221 |
| 3.844999999999856 | 0.254 | 0.24 | 0.221 |
| 3.849999999999856 | 0.254 | 0.24 | 0.221 |
| 3.854999999999856 | 0.254 | 0.239 | 0.22 |
| 3.859999999999855 | 0.253 | 0.239 | 0.22 |
| 3.864999999999855 | 0.253 | 0.239 | 0.22 |
| 3.869999999999855 | 0.253 | 0.238 | 0.22 |
| 3.874999999999855 | 0.253 | 0.238 | 0.22 |
| 3.879999999999855 | 0.252 | 0.238 | 0.219 |
| 3.884999999999855 | 0.252 | 0.238 | 0.219 |
| 3.889999999999855 | 0.252 | 0.237 | 0.219 |
| 3.894999999999855 | 0.251 | 0.237 | 0.219 |
| 3.899999999999855 | 0.251 | 0.237 | 0.219 |
| 3.904999999999855 | 0.251 | 0.237 | 0.218 |
| 3.909999999999854 | 0.25 | 0.236 | 0.218 |
| 3.914999999999854 | 0.25 | 0.236 | 0.218 |
| 3.919999999999854 | 0.25 | 0.236 | 0.218 |
| 3.924999999999854 | 0.249 | 0.236 | 0.218 |
| 3.929999999999854 | 0.249 | 0.235 | 0.217 |
| 3.934999999999854 | 0.249 | 0.235 | 0.217 |
| 3.939999999999854 | 0.249 | 0.235 | 0.217 |
| 3.944999999999854 | 0.248 | 0.235 | 0.217 |
| 3.949999999999854 | 0.248 | 0.234 | 0.217 |
| 3.954999999999853 | 0.248 | 0.234 | 0.216 |
| 3.959999999999853 | 0.247 | 0.234 | 0.216 |
| 3.964999999999853 | 0.247 | 0.234 | 0.216 |
| 3.969999999999853 | 0.247 | 0.233 | 0.216 |
| 3.974999999999853 | 0.246 | 0.233 | 0.216 |
| 3.979999999999853 | 0.246 | 0.233 | 0.215 |
| 3.984999999999853 | 0.246 | 0.233 | 0.215 |
| 3.989999999999853 | 0.246 | 0.232 | 0.215 |
| 3.994999999999853 | 0.245 | 0.232 | 0.215 |
| 3.999999999999853 | 0.245 | 0.232 | 0.215 |
| 4.004999999999852 | 0.245 | 0.232 | 0.214 |
| 4.009999999999852 | 0.244 | 0.231 | 0.214 |
| 4.014999999999852 | 0.244 | 0.231 | 0.214 |
| 4.019999999999852 | 0.244 | 0.231 | 0.214 |
| 4.024999999999852 | 0.244 | 0.231 | 0.214 |
| 4.029999999999852 | 0.243 | 0.23 | 0.213 |
| 4.034999999999852 | 0.243 | 0.23 | 0.213 |
| 4.039999999999851 | 0.243 | 0.23 | 0.213 |
| 4.044999999999852 | 0.242 | 0.23 | 0.213 |
| 4.049999999999851 | 0.242 | 0.229 | 0.213 |
| 4.054999999999851 | 0.242 | 0.229 | 0.212 |
| 4.059999999999851 | 0.241 | 0.229 | 0.212 |
| 4.064999999999851 | 0.241 | 0.229 | 0.212 |
| 4.069999999999851 | 0.241 | 0.228 | 0.212 |
| 4.074999999999851 | 0.241 | 0.228 | 0.212 |
| 4.07999999999985 | 0.24 | 0.228 | 0.211 |
| 4.084999999999851 | 0.24 | 0.228 | 0.211 |
| 4.08999999999985 | 0.24 | 0.227 | 0.211 |
| 4.094999999999851 | 0.24 | 0.227 | 0.211 |
| 4.09999999999985 | 0.239 | 0.227 | 0.211 |
| 4.10499999999985 | 0.239 | 0.227 | 0.21 |
| 4.10999999999985 | 0.239 | 0.226 | 0.21 |
| 4.11499999999985 | 0.238 | 0.226 | 0.21 |
| 4.11999999999985 | 0.238 | 0.226 | 0.21 |
| 4.12499999999985 | 0.238 | 0.226 | 0.21 |
| 4.12999999999985 | 0.238 | 0.225 | 0.209 |
| 4.13499999999985 | 0.237 | 0.225 | 0.209 |
| 4.13999999999985 | 0.237 | 0.225 | 0.209 |
| 4.144999999999849 | 0.237 | 0.225 | 0.209 |
| 4.14999999999985 | 0.236 | 0.225 | 0.209 |
| 4.154999999999849 | 0.236 | 0.224 | 0.208 |
| 4.15999999999985 | 0.236 | 0.224 | 0.208 |
| 4.164999999999849 | 0.236 | 0.224 | 0.208 |
| 4.169999999999849 | 0.235 | 0.224 | 0.208 |
| 4.174999999999849 | 0.235 | 0.223 | 0.208 |
| 4.179999999999848 | 0.235 | 0.223 | 0.208 |
| 4.184999999999849 | 0.235 | 0.223 | 0.207 |
| 4.189999999999848 | 0.234 | 0.223 | 0.207 |
| 4.194999999999848 | 0.234 | 0.222 | 0.207 |
| 4.199999999999848 | 0.234 | 0.222 | 0.207 |
| 4.204999999999848 | 0.233 | 0.222 | 0.207 |
| 4.209999999999848 | 0.233 | 0.222 | 0.206 |
| 4.214999999999848 | 0.233 | 0.222 | 0.206 |
| 4.219999999999847 | 0.233 | 0.221 | 0.206 |
| 4.224999999999848 | 0.232 | 0.221 | 0.206 |
| 4.229999999999847 | 0.232 | 0.221 | 0.206 |
| 4.234999999999847 | 0.232 | 0.221 | 0.205 |
| 4.239999999999847 | 0.232 | 0.22 | 0.205 |
| 4.244999999999847 | 0.231 | 0.22 | 0.205 |
| 4.249999999999847 | 0.231 | 0.22 | 0.205 |
| 4.254999999999847 | 0.231 | 0.22 | 0.205 |
| 4.259999999999846 | 0.231 | 0.219 | 0.205 |
| 4.264999999999847 | 0.23 | 0.219 | 0.204 |
| 4.269999999999846 | 0.23 | 0.219 | 0.204 |
| 4.274999999999846 | 0.23 | 0.219 | 0.204 |
| 4.279999999999846 | 0.23 | 0.219 | 0.204 |
| 4.284999999999846 | 0.229 | 0.218 | 0.204 |
| 4.289999999999846 | 0.229 | 0.218 | 0.203 |
| 4.294999999999846 | 0.229 | 0.218 | 0.203 |
| 4.299999999999846 | 0.228 | 0.218 | 0.203 |
| 4.304999999999846 | 0.228 | 0.217 | 0.203 |
| 4.309999999999845 | 0.228 | 0.217 | 0.203 |
| 4.314999999999846 | 0.228 | 0.217 | 0.203 |
| 4.319999999999845 | 0.227 | 0.217 | 0.202 |
| 4.324999999999846 | 0.227 | 0.217 | 0.202 |
| 4.329999999999845 | 0.227 | 0.216 | 0.202 |
| 4.334999999999845 | 0.227 | 0.216 | 0.202 |
| 4.339999999999845 | 0.226 | 0.216 | 0.202 |
| 4.344999999999845 | 0.226 | 0.216 | 0.201 |
| 4.349999999999845 | 0.226 | 0.215 | 0.201 |
| 4.354999999999845 | 0.226 | 0.215 | 0.201 |
| 4.359999999999844 | 0.225 | 0.215 | 0.201 |
| 4.364999999999845 | 0.225 | 0.215 | 0.201 |
| 4.369999999999844 | 0.225 | 0.215 | 0.201 |
| 4.374999999999844 | 0.225 | 0.214 | 0.2 |
| 4.379999999999844 | 0.224 | 0.214 | 0.2 |
| 4.384999999999844 | 0.224 | 0.214 | 0.2 |
| 4.389999999999844 | 0.224 | 0.214 | 0.2 |
| 4.394999999999844 | 0.224 | 0.214 | 0.2 |
| 4.399999999999844 | 0.223 | 0.213 | 0.199 |
| 4.404999999999844 | 0.223 | 0.213 | 0.199 |
| 4.409999999999843 | 0.223 | 0.213 | 0.199 |
| 4.414999999999844 | 0.223 | 0.213 | 0.199 |
| 4.419999999999843 | 0.222 | 0.212 | 0.199 |
| 4.424999999999843 | 0.222 | 0.212 | 0.199 |
| 4.429999999999843 | 0.222 | 0.212 | 0.198 |
| 4.434999999999843 | 0.222 | 0.212 | 0.198 |
| 4.439999999999843 | 0.222 | 0.212 | 0.198 |
| 4.444999999999843 | 0.221 | 0.211 | 0.198 |
| 4.449999999999842 | 0.221 | 0.211 | 0.198 |
| 4.454999999999843 | 0.221 | 0.211 | 0.198 |
| 4.459999999999842 | 0.221 | 0.211 | 0.197 |
| 4.464999999999843 | 0.22 | 0.211 | 0.197 |
| 4.469999999999842 | 0.22 | 0.21 | 0.197 |
| 4.474999999999842 | 0.22 | 0.21 | 0.197 |
| 4.479999999999842 | 0.22 | 0.21 | 0.197 |
| 4.484999999999842 | 0.219 | 0.21 | 0.197 |
| 4.489999999999842 | 0.219 | 0.21 | 0.196 |
| 4.494999999999842 | 0.219 | 0.209 | 0.196 |
| 4.499999999999841 | 0.219 | 0.209 | 0.196 |
| 4.504999999999842 | 0.218 | 0.209 | 0.196 |
| 4.509999999999841 | 0.218 | 0.209 | 0.196 |
| 4.514999999999842 | 0.218 | 0.208 | 0.195 |
| 4.519999999999841 | 0.218 | 0.208 | 0.195 |
| 4.524999999999841 | 0.217 | 0.208 | 0.195 |
| 4.529999999999841 | 0.217 | 0.208 | 0.195 |
| 4.534999999999841 | 0.217 | 0.208 | 0.195 |
| 4.53999999999984 | 0.217 | 0.207 | 0.195 |
| 4.544999999999841 | 0.217 | 0.207 | 0.194 |
| 4.54999999999984 | 0.216 | 0.207 | 0.194 |
| 4.554999999999841 | 0.216 | 0.207 | 0.194 |
| 4.55999999999984 | 0.216 | 0.207 | 0.194 |
| 4.564999999999841 | 0.216 | 0.206 | 0.194 |
| 4.56999999999984 | 0.215 | 0.206 | 0.194 |
| 4.57499999999984 | 0.215 | 0.206 | 0.193 |
| 4.57999999999984 | 0.215 | 0.206 | 0.193 |
| 4.58499999999984 | 0.215 | 0.206 | 0.193 |
| 4.58999999999984 | 0.215 | 0.205 | 0.193 |
| 4.59499999999984 | 0.214 | 0.205 | 0.193 |
| 4.59999999999984 | 0.214 | 0.205 | 0.193 |
| 4.60499999999984 | 0.214 | 0.205 | 0.192 |
| 4.60999999999984 | 0.214 | 0.205 | 0.192 |
| 4.614999999999839 | 0.213 | 0.204 | 0.192 |
| 4.61999999999984 | 0.213 | 0.204 | 0.192 |
| 4.624999999999839 | 0.213 | 0.204 | 0.192 |
| 4.62999999999984 | 0.213 | 0.204 | 0.192 |
| 4.634999999999839 | 0.212 | 0.204 | 0.191 |
| 4.639999999999838 | 0.212 | 0.203 | 0.191 |
| 4.644999999999839 | 0.212 | 0.203 | 0.191 |
| 4.649999999999838 | 0.212 | 0.203 | 0.191 |
| 4.654999999999839 | 0.212 | 0.203 | 0.191 |
| 4.659999999999838 | 0.211 | 0.203 | 0.191 |
| 4.664999999999838 | 0.211 | 0.203 | 0.19 |
| 4.669999999999838 | 0.211 | 0.202 | 0.19 |
| 4.674999999999838 | 0.211 | 0.202 | 0.19 |
| 4.679999999999837 | 0.211 | 0.202 | 0.19 |
| 4.684999999999838 | 0.21 | 0.202 | 0.19 |
| 4.689999999999837 | 0.21 | 0.202 | 0.19 |
| 4.694999999999838 | 0.21 | 0.201 | 0.19 |
| 4.699999999999837 | 0.21 | 0.201 | 0.189 |
| 4.704999999999837 | 0.209 | 0.201 | 0.189 |
| 4.709999999999837 | 0.209 | 0.201 | 0.189 |
| 4.714999999999837 | 0.209 | 0.201 | 0.189 |
| 4.719999999999837 | 0.209 | 0.2 | 0.189 |
| 4.724999999999837 | 0.209 | 0.2 | 0.189 |
| 4.729999999999836 | 0.208 | 0.2 | 0.188 |
| 4.734999999999836 | 0.208 | 0.2 | 0.188 |
| 4.739999999999836 | 0.208 | 0.2 | 0.188 |
| 4.744999999999836 | 0.208 | 0.199 | 0.188 |
| 4.749999999999836 | 0.207 | 0.199 | 0.188 |
| 4.754999999999836 | 0.207 | 0.199 | 0.188 |
| 4.759999999999836 | 0.207 | 0.199 | 0.187 |
| 4.764999999999836 | 0.207 | 0.199 | 0.187 |
| 4.769999999999836 | 0.207 | 0.199 | 0.187 |
| 4.774999999999835 | 0.206 | 0.198 | 0.187 |
| 4.779999999999835 | 0.206 | 0.198 | 0.187 |
| 4.784999999999835 | 0.206 | 0.198 | 0.187 |
| 4.789999999999835 | 0.206 | 0.198 | 0.187 |
| 4.794999999999835 | 0.206 | 0.198 | 0.186 |
| 4.799999999999835 | 0.205 | 0.197 | 0.186 |
| 4.804999999999835 | 0.205 | 0.197 | 0.186 |
| 4.809999999999835 | 0.205 | 0.197 | 0.186 |
| 4.814999999999835 | 0.205 | 0.197 | 0.186 |
| 4.819999999999835 | 0.205 | 0.197 | 0.186 |
| 4.824999999999835 | 0.204 | 0.196 | 0.185 |
| 4.829999999999834 | 0.204 | 0.196 | 0.185 |
| 4.834999999999834 | 0.204 | 0.196 | 0.185 |
| 4.839999999999834 | 0.204 | 0.196 | 0.185 |
| 4.844999999999834 | 0.204 | 0.196 | 0.185 |
| 4.849999999999834 | 0.203 | 0.196 | 0.185 |
| 4.854999999999834 | 0.203 | 0.195 | 0.184 |
| 4.859999999999834 | 0.203 | 0.195 | 0.184 |
| 4.864999999999834 | 0.203 | 0.195 | 0.184 |
| 4.869999999999834 | 0.203 | 0.195 | 0.184 |
| 4.874999999999834 | 0.202 | 0.195 | 0.184 |
| 4.879999999999833 | 0.202 | 0.194 | 0.184 |
| 4.884999999999834 | 0.202 | 0.194 | 0.184 |
| 4.889999999999833 | 0.202 | 0.194 | 0.183 |
| 4.894999999999833 | 0.202 | 0.194 | 0.183 |
| 4.899999999999833 | 0.201 | 0.194 | 0.183 |
| 4.904999999999833 | 0.201 | 0.194 | 0.183 |
| 4.909999999999833 | 0.201 | 0.193 | 0.183 |
| 4.914999999999833 | 0.201 | 0.193 | 0.183 |
| 4.919999999999832 | 0.201 | 0.193 | 0.183 |
| 4.924999999999833 | 0.2 | 0.193 | 0.182 |
| 4.929999999999832 | 0.2 | 0.193 | 0.182 |
| 4.934999999999832 | 0.2 | 0.193 | 0.182 |
| 4.939999999999832 | 0.2 | 0.192 | 0.182 |
| 4.944999999999832 | 0.2 | 0.192 | 0.182 |
| 4.949999999999832 | 0.199 | 0.192 | 0.182 |
| 4.954999999999832 | 0.199 | 0.192 | 0.181 |
| 4.959999999999832 | 0.199 | 0.192 | 0.181 |
| 4.964999999999832 | 0.199 | 0.191 | 0.181 |
| 4.969999999999831 | 0.199 | 0.191 | 0.181 |
| 4.974999999999831 | 0.198 | 0.191 | 0.181 |
| 4.97999999999983 | 0.198 | 0.191 | 0.181 |
| 4.984999999999831 | 0.198 | 0.191 | 0.181 |
| 4.98999999999983 | 0.198 | 0.191 | 0.18 |
| 4.994999999999831 | 0.198 | 0.19 | 0.18 |
| 4.99999999999983 | 0.197 | 0.19 | 0.18 |